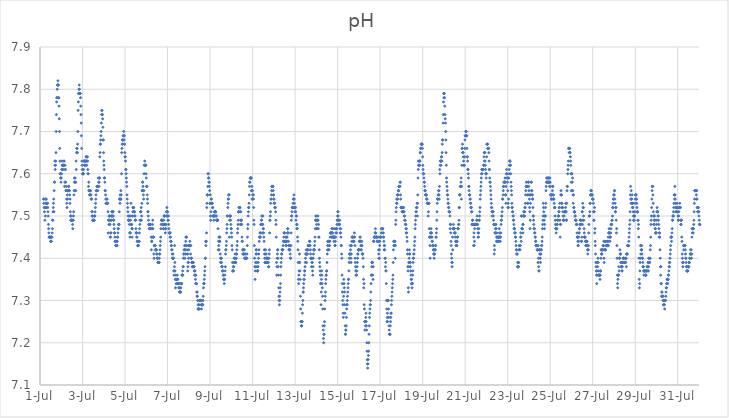
| Category | pH |
|---|---|
| 44743.166666666664 | 7.54 |
| 44743.177083333336 | 7.53 |
| 44743.1875 | 7.54 |
| 44743.197916666664 | 7.52 |
| 44743.208333333336 | 7.51 |
| 44743.21875 | 7.52 |
| 44743.229166666664 | 7.49 |
| 44743.239583333336 | 7.52 |
| 44743.25 | 7.5 |
| 44743.260416666664 | 7.53 |
| 44743.270833333336 | 7.54 |
| 44743.28125 | 7.54 |
| 44743.291666666664 | 7.54 |
| 44743.302083333336 | 7.52 |
| 44743.3125 | 7.53 |
| 44743.322916666664 | 7.53 |
| 44743.333333333336 | 7.53 |
| 44743.34375 | 7.53 |
| 44743.354166666664 | 7.53 |
| 44743.364583333336 | 7.52 |
| 44743.375 | 7.51 |
| 44743.385416666664 | 7.5 |
| 44743.395833333336 | 7.48 |
| 44743.40625 | 7.47 |
| 44743.416666666664 | 7.46 |
| 44743.427083333336 | 7.45 |
| 44743.4375 | 7.45 |
| 44743.447916666664 | 7.45 |
| 44743.458333333336 | 7.45 |
| 44743.46875 | 7.45 |
| 44743.479166666664 | 7.45 |
| 44743.489583333336 | 7.45 |
| 44743.5 | 7.44 |
| 44743.510416666664 | 7.44 |
| 44743.520833333336 | 7.44 |
| 44743.53125 | 7.44 |
| 44743.541666666664 | 7.45 |
| 44743.552083333336 | 7.45 |
| 44743.5625 | 7.45 |
| 44743.572916666664 | 7.46 |
| 44743.583333333336 | 7.47 |
| 44743.59375 | 7.49 |
| 44743.604166666664 | 7.49 |
| 44743.614583333336 | 7.51 |
| 44743.625 | 7.52 |
| 44743.635416666664 | 7.53 |
| 44743.645833333336 | 7.54 |
| 44743.65625 | 7.51 |
| 44743.666666666664 | 7.56 |
| 44743.677083333336 | 7.58 |
| 44743.6875 | 7.58 |
| 44743.697916666664 | 7.63 |
| 44743.708333333336 | 7.62 |
| 44743.71875 | 7.61 |
| 44743.729166666664 | 7.62 |
| 44743.739583333336 | 7.63 |
| 44743.75 | 7.65 |
| 44743.760416666664 | 7.7 |
| 44743.770833333336 | 7.74 |
| 44743.78125 | 7.77 |
| 44743.791666666664 | 7.78 |
| 44743.802083333336 | 7.78 |
| 44743.8125 | 7.8 |
| 44743.822916666664 | 7.81 |
| 44743.833333333336 | 7.81 |
| 44743.84375 | 7.82 |
| 44743.854166666664 | 7.81 |
| 44743.864583333336 | 7.81 |
| 44743.875 | 7.78 |
| 44743.885416666664 | 7.78 |
| 44743.895833333336 | 7.76 |
| 44743.90625 | 7.73 |
| 44743.916666666664 | 7.7 |
| 44743.927083333336 | 7.66 |
| 44743.9375 | 7.63 |
| 44743.947916666664 | 7.6 |
| 44743.958333333336 | 7.6 |
| 44743.96875 | 7.59 |
| 44743.979166666664 | 7.59 |
| 44743.989583333336 | 7.58 |
| 44744.0 | 7.59 |
| 44744.010416666664 | 7.6 |
| 44744.020833333336 | 7.61 |
| 44744.03125 | 7.63 |
| 44744.041666666664 | 7.62 |
| 44744.052083333336 | 7.61 |
| 44744.0625 | 7.62 |
| 44744.072916666664 | 7.62 |
| 44744.083333333336 | 7.61 |
| 44744.09375 | 7.62 |
| 44744.104166666664 | 7.62 |
| 44744.114583333336 | 7.62 |
| 44744.125 | 7.63 |
| 44744.135416666664 | 7.63 |
| 44744.145833333336 | 7.62 |
| 44744.15625 | 7.57 |
| 44744.166666666664 | 7.58 |
| 44744.177083333336 | 7.62 |
| 44744.1875 | 7.61 |
| 44744.197916666664 | 7.61 |
| 44744.208333333336 | 7.58 |
| 44744.21875 | 7.56 |
| 44744.229166666664 | 7.56 |
| 44744.239583333336 | 7.57 |
| 44744.25 | 7.54 |
| 44744.260416666664 | 7.53 |
| 44744.270833333336 | 7.52 |
| 44744.28125 | 7.55 |
| 44744.291666666664 | 7.56 |
| 44744.302083333336 | 7.54 |
| 44744.3125 | 7.56 |
| 44744.322916666664 | 7.56 |
| 44744.333333333336 | 7.56 |
| 44744.34375 | 7.57 |
| 44744.354166666664 | 7.57 |
| 44744.364583333336 | 7.56 |
| 44744.375 | 7.56 |
| 44744.385416666664 | 7.56 |
| 44744.395833333336 | 7.55 |
| 44744.40625 | 7.53 |
| 44744.416666666664 | 7.54 |
| 44744.427083333336 | 7.51 |
| 44744.4375 | 7.5 |
| 44744.447916666664 | 7.49 |
| 44744.458333333336 | 7.5 |
| 44744.46875 | 7.49 |
| 44744.479166666664 | 7.49 |
| 44744.489583333336 | 7.49 |
| 44744.5 | 7.49 |
| 44744.510416666664 | 7.49 |
| 44744.520833333336 | 7.49 |
| 44744.53125 | 7.48 |
| 44744.541666666664 | 7.47 |
| 44744.552083333336 | 7.49 |
| 44744.5625 | 7.49 |
| 44744.572916666664 | 7.5 |
| 44744.583333333336 | 7.51 |
| 44744.59375 | 7.55 |
| 44744.604166666664 | 7.56 |
| 44744.614583333336 | 7.59 |
| 44744.625 | 7.58 |
| 44744.635416666664 | 7.58 |
| 44744.645833333336 | 7.58 |
| 44744.65625 | 7.59 |
| 44744.666666666664 | 7.56 |
| 44744.677083333336 | 7.56 |
| 44744.6875 | 7.58 |
| 44744.697916666664 | 7.63 |
| 44744.708333333336 | 7.61 |
| 44744.71875 | 7.65 |
| 44744.729166666664 | 7.66 |
| 44744.739583333336 | 7.66 |
| 44744.75 | 7.65 |
| 44744.760416666664 | 7.65 |
| 44744.770833333336 | 7.67 |
| 44744.78125 | 7.7 |
| 44744.791666666664 | 7.75 |
| 44744.802083333336 | 7.77 |
| 44744.8125 | 7.79 |
| 44744.822916666664 | 7.79 |
| 44744.833333333336 | 7.8 |
| 44744.84375 | 7.81 |
| 44744.854166666664 | 7.8 |
| 44744.864583333336 | 7.79 |
| 44744.875 | 7.79 |
| 44744.885416666664 | 7.79 |
| 44744.895833333336 | 7.79 |
| 44744.90625 | 7.78 |
| 44744.916666666664 | 7.76 |
| 44744.927083333336 | 7.74 |
| 44744.9375 | 7.72 |
| 44744.947916666664 | 7.69 |
| 44744.958333333336 | 7.66 |
| 44744.96875 | 7.63 |
| 44744.979166666664 | 7.62 |
| 44744.989583333336 | 7.61 |
| 44745.0 | 7.6 |
| 44745.010416666664 | 7.6 |
| 44745.020833333336 | 7.6 |
| 44745.03125 | 7.6 |
| 44745.041666666664 | 7.6 |
| 44745.052083333336 | 7.61 |
| 44745.0625 | 7.63 |
| 44745.072916666664 | 7.63 |
| 44745.083333333336 | 7.63 |
| 44745.09375 | 7.62 |
| 44745.104166666664 | 7.62 |
| 44745.114583333336 | 7.63 |
| 44745.125 | 7.63 |
| 44745.135416666664 | 7.63 |
| 44745.15625 | 7.62 |
| 44745.166666666664 | 7.64 |
| 44745.177083333336 | 7.64 |
| 44745.1875 | 7.63 |
| 44745.197916666664 | 7.62 |
| 44745.208333333336 | 7.63 |
| 44745.21875 | 7.64 |
| 44745.229166666664 | 7.64 |
| 44745.239583333336 | 7.63 |
| 44745.25 | 7.61 |
| 44745.260416666664 | 7.6 |
| 44745.270833333336 | 7.6 |
| 44745.28125 | 7.57 |
| 44745.291666666664 | 7.58 |
| 44745.302083333336 | 7.56 |
| 44745.3125 | 7.56 |
| 44745.322916666664 | 7.56 |
| 44745.333333333336 | 7.55 |
| 44745.34375 | 7.55 |
| 44745.354166666664 | 7.56 |
| 44745.364583333336 | 7.56 |
| 44745.375 | 7.56 |
| 44745.385416666664 | 7.55 |
| 44745.395833333336 | 7.55 |
| 44745.40625 | 7.54 |
| 44745.416666666664 | 7.54 |
| 44745.427083333336 | 7.54 |
| 44745.4375 | 7.51 |
| 44745.447916666664 | 7.5 |
| 44745.458333333336 | 7.51 |
| 44745.46875 | 7.5 |
| 44745.479166666664 | 7.49 |
| 44745.489583333336 | 7.49 |
| 44745.5 | 7.49 |
| 44745.510416666664 | 7.49 |
| 44745.520833333336 | 7.49 |
| 44745.53125 | 7.49 |
| 44745.541666666664 | 7.49 |
| 44745.552083333336 | 7.49 |
| 44745.5625 | 7.5 |
| 44745.572916666664 | 7.5 |
| 44745.583333333336 | 7.5 |
| 44745.59375 | 7.51 |
| 44745.604166666664 | 7.52 |
| 44745.614583333336 | 7.53 |
| 44745.625 | 7.54 |
| 44745.635416666664 | 7.55 |
| 44745.645833333336 | 7.56 |
| 44745.65625 | 7.56 |
| 44745.666666666664 | 7.56 |
| 44745.677083333336 | 7.57 |
| 44745.6875 | 7.57 |
| 44745.697916666664 | 7.57 |
| 44745.708333333336 | 7.57 |
| 44745.71875 | 7.56 |
| 44745.729166666664 | 7.57 |
| 44745.739583333336 | 7.59 |
| 44745.75 | 7.57 |
| 44745.760416666664 | 7.58 |
| 44745.770833333336 | 7.57 |
| 44745.78125 | 7.58 |
| 44745.791666666664 | 7.59 |
| 44745.802083333336 | 7.59 |
| 44745.8125 | 7.64 |
| 44745.822916666664 | 7.65 |
| 44745.833333333336 | 7.67 |
| 44745.84375 | 7.67 |
| 44745.854166666664 | 7.68 |
| 44745.864583333336 | 7.69 |
| 44745.875 | 7.7 |
| 44745.885416666664 | 7.72 |
| 44745.895833333336 | 7.74 |
| 44745.90625 | 7.75 |
| 44745.916666666664 | 7.75 |
| 44745.927083333336 | 7.74 |
| 44745.9375 | 7.74 |
| 44745.947916666664 | 7.73 |
| 44745.958333333336 | 7.71 |
| 44745.96875 | 7.68 |
| 44745.979166666664 | 7.68 |
| 44745.989583333336 | 7.65 |
| 44746.0 | 7.63 |
| 44746.010416666664 | 7.62 |
| 44746.020833333336 | 7.61 |
| 44746.03125 | 7.59 |
| 44746.041666666664 | 7.59 |
| 44746.052083333336 | 7.58 |
| 44746.0625 | 7.56 |
| 44746.072916666664 | 7.56 |
| 44746.083333333336 | 7.55 |
| 44746.09375 | 7.54 |
| 44746.104166666664 | 7.53 |
| 44746.114583333336 | 7.53 |
| 44746.125 | 7.53 |
| 44746.135416666664 | 7.53 |
| 44746.145833333336 | 7.54 |
| 44746.15625 | 7.54 |
| 44746.166666666664 | 7.53 |
| 44746.177083333336 | 7.53 |
| 44746.1875 | 7.53 |
| 44746.197916666664 | 7.51 |
| 44746.208333333336 | 7.46 |
| 44746.21875 | 7.49 |
| 44746.229166666664 | 7.49 |
| 44746.239583333336 | 7.48 |
| 44746.25 | 7.5 |
| 44746.260416666664 | 7.49 |
| 44746.270833333336 | 7.5 |
| 44746.28125 | 7.5 |
| 44746.291666666664 | 7.48 |
| 44746.302083333336 | 7.45 |
| 44746.3125 | 7.45 |
| 44746.322916666664 | 7.46 |
| 44746.333333333336 | 7.49 |
| 44746.34375 | 7.46 |
| 44746.354166666664 | 7.49 |
| 44746.364583333336 | 7.5 |
| 44746.375 | 7.51 |
| 44746.385416666664 | 7.5 |
| 44746.395833333336 | 7.51 |
| 44746.40625 | 7.5 |
| 44746.416666666664 | 7.51 |
| 44746.427083333336 | 7.51 |
| 44746.4375 | 7.51 |
| 44746.447916666664 | 7.5 |
| 44746.458333333336 | 7.49 |
| 44746.46875 | 7.49 |
| 44746.479166666664 | 7.48 |
| 44746.489583333336 | 7.47 |
| 44746.5 | 7.46 |
| 44746.510416666664 | 7.46 |
| 44746.520833333336 | 7.45 |
| 44746.53125 | 7.44 |
| 44746.541666666664 | 7.44 |
| 44746.552083333336 | 7.44 |
| 44746.5625 | 7.43 |
| 44746.572916666664 | 7.43 |
| 44746.583333333336 | 7.44 |
| 44746.59375 | 7.43 |
| 44746.604166666664 | 7.43 |
| 44746.614583333336 | 7.44 |
| 44746.625 | 7.43 |
| 44746.635416666664 | 7.44 |
| 44746.645833333336 | 7.45 |
| 44746.65625 | 7.45 |
| 44746.666666666664 | 7.46 |
| 44746.677083333336 | 7.47 |
| 44746.6875 | 7.47 |
| 44746.697916666664 | 7.48 |
| 44746.708333333336 | 7.48 |
| 44746.71875 | 7.48 |
| 44746.729166666664 | 7.51 |
| 44746.739583333336 | 7.54 |
| 44746.75 | 7.54 |
| 44746.760416666664 | 7.53 |
| 44746.770833333336 | 7.55 |
| 44746.78125 | 7.54 |
| 44746.791666666664 | 7.54 |
| 44746.802083333336 | 7.56 |
| 44746.8125 | 7.54 |
| 44746.822916666664 | 7.55 |
| 44746.833333333336 | 7.6 |
| 44746.84375 | 7.65 |
| 44746.854166666664 | 7.66 |
| 44746.864583333336 | 7.67 |
| 44746.875 | 7.68 |
| 44746.885416666664 | 7.68 |
| 44746.895833333336 | 7.67 |
| 44746.90625 | 7.69 |
| 44746.916666666664 | 7.68 |
| 44746.927083333336 | 7.69 |
| 44746.9375 | 7.7 |
| 44746.947916666664 | 7.69 |
| 44746.958333333336 | 7.68 |
| 44746.96875 | 7.69 |
| 44746.979166666664 | 7.67 |
| 44746.989583333336 | 7.65 |
| 44747.0 | 7.64 |
| 44747.010416666664 | 7.64 |
| 44747.020833333336 | 7.63 |
| 44747.03125 | 7.61 |
| 44747.041666666664 | 7.61 |
| 44747.052083333336 | 7.6 |
| 44747.0625 | 7.59 |
| 44747.072916666664 | 7.58 |
| 44747.083333333336 | 7.57 |
| 44747.09375 | 7.55 |
| 44747.104166666664 | 7.54 |
| 44747.114583333336 | 7.53 |
| 44747.125 | 7.52 |
| 44747.135416666664 | 7.51 |
| 44747.145833333336 | 7.5 |
| 44747.15625 | 7.49 |
| 44747.166666666664 | 7.49 |
| 44747.177083333336 | 7.49 |
| 44747.1875 | 7.49 |
| 44747.197916666664 | 7.5 |
| 44747.208333333336 | 7.48 |
| 44747.21875 | 7.46 |
| 44747.229166666664 | 7.45 |
| 44747.239583333336 | 7.46 |
| 44747.25 | 7.46 |
| 44747.260416666664 | 7.49 |
| 44747.270833333336 | 7.5 |
| 44747.28125 | 7.53 |
| 44747.291666666664 | 7.48 |
| 44747.302083333336 | 7.48 |
| 44747.3125 | 7.48 |
| 44747.322916666664 | 7.47 |
| 44747.333333333336 | 7.45 |
| 44747.34375 | 7.47 |
| 44747.354166666664 | 7.5 |
| 44747.364583333336 | 7.51 |
| 44747.375 | 7.52 |
| 44747.385416666664 | 7.52 |
| 44747.395833333336 | 7.52 |
| 44747.40625 | 7.52 |
| 44747.416666666664 | 7.51 |
| 44747.427083333336 | 7.51 |
| 44747.4375 | 7.51 |
| 44747.447916666664 | 7.51 |
| 44747.458333333336 | 7.5 |
| 44747.46875 | 7.5 |
| 44747.479166666664 | 7.49 |
| 44747.489583333336 | 7.49 |
| 44747.5 | 7.49 |
| 44747.510416666664 | 7.47 |
| 44747.520833333336 | 7.46 |
| 44747.53125 | 7.46 |
| 44747.541666666664 | 7.46 |
| 44747.552083333336 | 7.45 |
| 44747.5625 | 7.45 |
| 44747.572916666664 | 7.44 |
| 44747.583333333336 | 7.44 |
| 44747.59375 | 7.43 |
| 44747.604166666664 | 7.43 |
| 44747.614583333336 | 7.43 |
| 44747.625 | 7.43 |
| 44747.635416666664 | 7.43 |
| 44747.645833333336 | 7.44 |
| 44747.65625 | 7.44 |
| 44747.666666666664 | 7.44 |
| 44747.677083333336 | 7.46 |
| 44747.6875 | 7.47 |
| 44747.697916666664 | 7.48 |
| 44747.708333333336 | 7.49 |
| 44747.71875 | 7.49 |
| 44747.729166666664 | 7.51 |
| 44747.739583333336 | 7.51 |
| 44747.75 | 7.51 |
| 44747.760416666664 | 7.52 |
| 44747.770833333336 | 7.49 |
| 44747.78125 | 7.5 |
| 44747.791666666664 | 7.53 |
| 44747.802083333336 | 7.56 |
| 44747.8125 | 7.56 |
| 44747.822916666664 | 7.58 |
| 44747.833333333336 | 7.58 |
| 44747.84375 | 7.57 |
| 44747.854166666664 | 7.56 |
| 44747.864583333336 | 7.55 |
| 44747.875 | 7.54 |
| 44747.885416666664 | 7.56 |
| 44747.895833333336 | 7.6 |
| 44747.90625 | 7.62 |
| 44747.916666666664 | 7.62 |
| 44747.927083333336 | 7.63 |
| 44747.9375 | 7.62 |
| 44747.947916666664 | 7.62 |
| 44747.958333333336 | 7.62 |
| 44747.96875 | 7.62 |
| 44747.979166666664 | 7.62 |
| 44747.989583333336 | 7.6 |
| 44748.0 | 7.59 |
| 44748.010416666664 | 7.57 |
| 44748.020833333336 | 7.57 |
| 44748.03125 | 7.57 |
| 44748.041666666664 | 7.55 |
| 44748.052083333336 | 7.54 |
| 44748.0625 | 7.53 |
| 44748.072916666664 | 7.51 |
| 44748.083333333336 | 7.51 |
| 44748.09375 | 7.5 |
| 44748.104166666664 | 7.49 |
| 44748.114583333336 | 7.48 |
| 44748.125 | 7.48 |
| 44748.135416666664 | 7.47 |
| 44748.145833333336 | 7.48 |
| 44748.15625 | 7.48 |
| 44748.166666666664 | 7.47 |
| 44748.177083333336 | 7.48 |
| 44748.1875 | 7.48 |
| 44748.197916666664 | 7.48 |
| 44748.208333333336 | 7.47 |
| 44748.21875 | 7.47 |
| 44748.229166666664 | 7.45 |
| 44748.239583333336 | 7.42 |
| 44748.25 | 7.44 |
| 44748.260416666664 | 7.44 |
| 44748.270833333336 | 7.45 |
| 44748.28125 | 7.47 |
| 44748.291666666664 | 7.48 |
| 44748.302083333336 | 7.49 |
| 44748.3125 | 7.47 |
| 44748.322916666664 | 7.45 |
| 44748.333333333336 | 7.45 |
| 44748.34375 | 7.45 |
| 44748.354166666664 | 7.41 |
| 44748.364583333336 | 7.4 |
| 44748.375 | 7.43 |
| 44748.385416666664 | 7.43 |
| 44748.395833333336 | 7.43 |
| 44748.40625 | 7.43 |
| 44748.416666666664 | 7.43 |
| 44748.427083333336 | 7.42 |
| 44748.4375 | 7.42 |
| 44748.447916666664 | 7.42 |
| 44748.458333333336 | 7.42 |
| 44748.46875 | 7.42 |
| 44748.479166666664 | 7.42 |
| 44748.489583333336 | 7.41 |
| 44748.5 | 7.41 |
| 44748.510416666664 | 7.4 |
| 44748.520833333336 | 7.4 |
| 44748.53125 | 7.4 |
| 44748.541666666664 | 7.4 |
| 44748.552083333336 | 7.39 |
| 44748.5625 | 7.39 |
| 44748.572916666664 | 7.39 |
| 44748.583333333336 | 7.39 |
| 44748.59375 | 7.39 |
| 44748.604166666664 | 7.39 |
| 44748.614583333336 | 7.4 |
| 44748.625 | 7.41 |
| 44748.635416666664 | 7.41 |
| 44748.645833333336 | 7.42 |
| 44748.65625 | 7.43 |
| 44748.666666666664 | 7.44 |
| 44748.677083333336 | 7.45 |
| 44748.6875 | 7.47 |
| 44748.697916666664 | 7.48 |
| 44748.708333333336 | 7.49 |
| 44748.71875 | 7.49 |
| 44748.729166666664 | 7.49 |
| 44748.739583333336 | 7.49 |
| 44748.75 | 7.49 |
| 44748.760416666664 | 7.49 |
| 44748.770833333336 | 7.48 |
| 44748.78125 | 7.48 |
| 44748.791666666664 | 7.48 |
| 44748.802083333336 | 7.47 |
| 44748.8125 | 7.47 |
| 44748.822916666664 | 7.49 |
| 44748.833333333336 | 7.5 |
| 44748.84375 | 7.5 |
| 44748.854166666664 | 7.5 |
| 44748.864583333336 | 7.48 |
| 44748.875 | 7.48 |
| 44748.885416666664 | 7.48 |
| 44748.895833333336 | 7.46 |
| 44748.90625 | 7.47 |
| 44748.916666666664 | 7.47 |
| 44748.927083333336 | 7.48 |
| 44748.9375 | 7.5 |
| 44748.947916666664 | 7.51 |
| 44748.958333333336 | 7.5 |
| 44748.96875 | 7.52 |
| 44748.979166666664 | 7.51 |
| 44748.989583333336 | 7.51 |
| 44749.0 | 7.51 |
| 44749.010416666664 | 7.5 |
| 44749.020833333336 | 7.49 |
| 44749.03125 | 7.49 |
| 44749.041666666664 | 7.5 |
| 44749.052083333336 | 7.48 |
| 44749.0625 | 7.47 |
| 44749.072916666664 | 7.46 |
| 44749.083333333336 | 7.46 |
| 44749.09375 | 7.46 |
| 44749.104166666664 | 7.46 |
| 44749.114583333336 | 7.45 |
| 44749.125 | 7.46 |
| 44749.135416666664 | 7.45 |
| 44749.145833333336 | 7.44 |
| 44749.15625 | 7.44 |
| 44749.166666666664 | 7.44 |
| 44749.177083333336 | 7.43 |
| 44749.1875 | 7.43 |
| 44749.197916666664 | 7.42 |
| 44749.208333333336 | 7.42 |
| 44749.21875 | 7.41 |
| 44749.229166666664 | 7.4 |
| 44749.239583333336 | 7.4 |
| 44749.25 | 7.4 |
| 44749.260416666664 | 7.41 |
| 44749.270833333336 | 7.4 |
| 44749.28125 | 7.4 |
| 44749.291666666664 | 7.37 |
| 44749.302083333336 | 7.36 |
| 44749.3125 | 7.37 |
| 44749.322916666664 | 7.38 |
| 44749.333333333336 | 7.43 |
| 44749.34375 | 7.39 |
| 44749.354166666664 | 7.37 |
| 44749.364583333336 | 7.35 |
| 44749.375 | 7.33 |
| 44749.385416666664 | 7.36 |
| 44749.395833333336 | 7.35 |
| 44749.40625 | 7.34 |
| 44749.416666666664 | 7.35 |
| 44749.427083333336 | 7.34 |
| 44749.4375 | 7.35 |
| 44749.447916666664 | 7.35 |
| 44749.458333333336 | 7.36 |
| 44749.46875 | 7.35 |
| 44749.479166666664 | 7.35 |
| 44749.489583333336 | 7.34 |
| 44749.5 | 7.34 |
| 44749.510416666664 | 7.34 |
| 44749.520833333336 | 7.34 |
| 44749.53125 | 7.33 |
| 44749.541666666664 | 7.33 |
| 44749.552083333336 | 7.34 |
| 44749.5625 | 7.32 |
| 44749.572916666664 | 7.32 |
| 44749.583333333336 | 7.33 |
| 44749.59375 | 7.32 |
| 44749.604166666664 | 7.32 |
| 44749.614583333336 | 7.32 |
| 44749.625 | 7.33 |
| 44749.635416666664 | 7.34 |
| 44749.645833333336 | 7.34 |
| 44749.65625 | 7.34 |
| 44749.666666666664 | 7.34 |
| 44749.677083333336 | 7.36 |
| 44749.6875 | 7.36 |
| 44749.697916666664 | 7.36 |
| 44749.708333333336 | 7.37 |
| 44749.71875 | 7.36 |
| 44749.729166666664 | 7.38 |
| 44749.739583333336 | 7.38 |
| 44749.75 | 7.4 |
| 44749.760416666664 | 7.41 |
| 44749.770833333336 | 7.41 |
| 44749.78125 | 7.42 |
| 44749.791666666664 | 7.42 |
| 44749.802083333336 | 7.43 |
| 44749.8125 | 7.4 |
| 44749.822916666664 | 7.43 |
| 44749.833333333336 | 7.42 |
| 44749.84375 | 7.41 |
| 44749.854166666664 | 7.44 |
| 44749.864583333336 | 7.45 |
| 44749.875 | 7.45 |
| 44749.885416666664 | 7.43 |
| 44749.895833333336 | 7.45 |
| 44749.90625 | 7.43 |
| 44749.916666666664 | 7.42 |
| 44749.927083333336 | 7.41 |
| 44749.9375 | 7.41 |
| 44749.947916666664 | 7.37 |
| 44749.958333333336 | 7.38 |
| 44749.96875 | 7.39 |
| 44749.979166666664 | 7.39 |
| 44749.989583333336 | 7.4 |
| 44750.0 | 7.42 |
| 44750.010416666664 | 7.43 |
| 44750.020833333336 | 7.43 |
| 44750.03125 | 7.43 |
| 44750.041666666664 | 7.43 |
| 44750.052083333336 | 7.44 |
| 44750.0625 | 7.43 |
| 44750.072916666664 | 7.43 |
| 44750.083333333336 | 7.41 |
| 44750.09375 | 7.43 |
| 44750.104166666664 | 7.4 |
| 44750.114583333336 | 7.4 |
| 44750.125 | 7.4 |
| 44750.135416666664 | 7.39 |
| 44750.145833333336 | 7.39 |
| 44750.15625 | 7.39 |
| 44750.166666666664 | 7.38 |
| 44750.177083333336 | 7.38 |
| 44750.1875 | 7.39 |
| 44750.197916666664 | 7.39 |
| 44750.208333333336 | 7.39 |
| 44750.21875 | 7.38 |
| 44750.229166666664 | 7.38 |
| 44750.239583333336 | 7.38 |
| 44750.25 | 7.38 |
| 44750.260416666664 | 7.37 |
| 44750.270833333336 | 7.36 |
| 44750.28125 | 7.37 |
| 44750.291666666664 | 7.37 |
| 44750.302083333336 | 7.36 |
| 44750.3125 | 7.35 |
| 44750.322916666664 | 7.34 |
| 44750.333333333336 | 7.36 |
| 44750.34375 | 7.34 |
| 44750.354166666664 | 7.34 |
| 44750.364583333336 | 7.34 |
| 44750.375 | 7.32 |
| 44750.385416666664 | 7.31 |
| 44750.395833333336 | 7.32 |
| 44750.40625 | 7.31 |
| 44750.416666666664 | 7.3 |
| 44750.427083333336 | 7.28 |
| 44750.4375 | 7.29 |
| 44750.447916666664 | 7.28 |
| 44750.458333333336 | 7.28 |
| 44750.46875 | 7.28 |
| 44750.479166666664 | 7.29 |
| 44750.489583333336 | 7.28 |
| 44750.5 | 7.3 |
| 44750.510416666664 | 7.3 |
| 44750.520833333336 | 7.3 |
| 44750.53125 | 7.3 |
| 44750.541666666664 | 7.3 |
| 44750.552083333336 | 7.3 |
| 44750.5625 | 7.3 |
| 44750.572916666664 | 7.3 |
| 44750.583333333336 | 7.29 |
| 44750.59375 | 7.28 |
| 44750.604166666664 | 7.29 |
| 44750.614583333336 | 7.29 |
| 44750.625 | 7.29 |
| 44750.635416666664 | 7.29 |
| 44750.645833333336 | 7.29 |
| 44750.65625 | 7.29 |
| 44750.666666666664 | 7.3 |
| 44750.677083333336 | 7.31 |
| 44750.6875 | 7.33 |
| 44750.697916666664 | 7.34 |
| 44750.708333333336 | 7.34 |
| 44750.71875 | 7.34 |
| 44750.729166666664 | 7.35 |
| 44750.739583333336 | 7.36 |
| 44750.75 | 7.37 |
| 44750.760416666664 | 7.38 |
| 44750.770833333336 | 7.4 |
| 44750.78125 | 7.4 |
| 44750.791666666664 | 7.44 |
| 44750.802083333336 | 7.43 |
| 44750.8125 | 7.44 |
| 44750.822916666664 | 7.44 |
| 44750.833333333336 | 7.46 |
| 44750.84375 | 7.52 |
| 44750.854166666664 | 7.53 |
| 44750.864583333336 | 7.55 |
| 44750.875 | 7.55 |
| 44750.885416666664 | 7.55 |
| 44750.895833333336 | 7.57 |
| 44750.90625 | 7.6 |
| 44750.916666666664 | 7.6 |
| 44750.927083333336 | 7.59 |
| 44750.9375 | 7.59 |
| 44750.947916666664 | 7.58 |
| 44750.958333333336 | 7.58 |
| 44750.96875 | 7.57 |
| 44750.979166666664 | 7.56 |
| 44750.989583333336 | 7.53 |
| 44751.0 | 7.53 |
| 44751.010416666664 | 7.55 |
| 44751.020833333336 | 7.5 |
| 44751.03125 | 7.49 |
| 44751.041666666664 | 7.51 |
| 44751.052083333336 | 7.54 |
| 44751.0625 | 7.54 |
| 44751.072916666664 | 7.53 |
| 44751.083333333336 | 7.53 |
| 44751.09375 | 7.53 |
| 44751.104166666664 | 7.53 |
| 44751.114583333336 | 7.52 |
| 44751.125 | 7.52 |
| 44751.135416666664 | 7.5 |
| 44751.145833333336 | 7.5 |
| 44751.15625 | 7.5 |
| 44751.166666666664 | 7.5 |
| 44751.177083333336 | 7.49 |
| 44751.1875 | 7.5 |
| 44751.197916666664 | 7.5 |
| 44751.208333333336 | 7.51 |
| 44751.21875 | 7.51 |
| 44751.229166666664 | 7.51 |
| 44751.239583333336 | 7.51 |
| 44751.25 | 7.51 |
| 44751.260416666664 | 7.5 |
| 44751.270833333336 | 7.51 |
| 44751.28125 | 7.5 |
| 44751.291666666664 | 7.5 |
| 44751.302083333336 | 7.49 |
| 44751.3125 | 7.49 |
| 44751.322916666664 | 7.49 |
| 44751.333333333336 | 7.49 |
| 44751.34375 | 7.49 |
| 44751.354166666664 | 7.49 |
| 44751.364583333336 | 7.49 |
| 44751.375 | 7.47 |
| 44751.385416666664 | 7.42 |
| 44751.395833333336 | 7.44 |
| 44751.40625 | 7.43 |
| 44751.416666666664 | 7.45 |
| 44751.427083333336 | 7.42 |
| 44751.4375 | 7.45 |
| 44751.447916666664 | 7.44 |
| 44751.458333333336 | 7.44 |
| 44751.46875 | 7.45 |
| 44751.479166666664 | 7.41 |
| 44751.489583333336 | 7.39 |
| 44751.5 | 7.4 |
| 44751.510416666664 | 7.4 |
| 44751.520833333336 | 7.4 |
| 44751.53125 | 7.4 |
| 44751.541666666664 | 7.39 |
| 44751.552083333336 | 7.38 |
| 44751.5625 | 7.38 |
| 44751.572916666664 | 7.38 |
| 44751.583333333336 | 7.37 |
| 44751.59375 | 7.37 |
| 44751.604166666664 | 7.37 |
| 44751.614583333336 | 7.36 |
| 44751.625 | 7.36 |
| 44751.635416666664 | 7.35 |
| 44751.645833333336 | 7.35 |
| 44751.65625 | 7.35 |
| 44751.666666666664 | 7.34 |
| 44751.677083333336 | 7.35 |
| 44751.6875 | 7.35 |
| 44751.697916666664 | 7.36 |
| 44751.708333333336 | 7.37 |
| 44751.71875 | 7.38 |
| 44751.729166666664 | 7.41 |
| 44751.739583333336 | 7.42 |
| 44751.75 | 7.42 |
| 44751.760416666664 | 7.43 |
| 44751.770833333336 | 7.44 |
| 44751.78125 | 7.46 |
| 44751.791666666664 | 7.47 |
| 44751.802083333336 | 7.48 |
| 44751.8125 | 7.5 |
| 44751.822916666664 | 7.5 |
| 44751.833333333336 | 7.52 |
| 44751.84375 | 7.53 |
| 44751.854166666664 | 7.54 |
| 44751.864583333336 | 7.54 |
| 44751.875 | 7.55 |
| 44751.885416666664 | 7.55 |
| 44751.895833333336 | 7.55 |
| 44751.90625 | 7.45 |
| 44751.916666666664 | 7.49 |
| 44751.927083333336 | 7.5 |
| 44751.9375 | 7.5 |
| 44751.947916666664 | 7.5 |
| 44751.958333333336 | 7.5 |
| 44751.96875 | 7.49 |
| 44751.979166666664 | 7.48 |
| 44751.989583333336 | 7.47 |
| 44752.0 | 7.47 |
| 44752.010416666664 | 7.46 |
| 44752.020833333336 | 7.45 |
| 44752.03125 | 7.43 |
| 44752.041666666664 | 7.42 |
| 44752.052083333336 | 7.39 |
| 44752.0625 | 7.37 |
| 44752.072916666664 | 7.37 |
| 44752.083333333336 | 7.37 |
| 44752.09375 | 7.38 |
| 44752.104166666664 | 7.37 |
| 44752.114583333336 | 7.38 |
| 44752.125 | 7.39 |
| 44752.135416666664 | 7.4 |
| 44752.145833333336 | 7.4 |
| 44752.15625 | 7.39 |
| 44752.166666666664 | 7.4 |
| 44752.177083333336 | 7.41 |
| 44752.1875 | 7.39 |
| 44752.197916666664 | 7.39 |
| 44752.208333333336 | 7.39 |
| 44752.21875 | 7.4 |
| 44752.229166666664 | 7.4 |
| 44752.239583333336 | 7.41 |
| 44752.25 | 7.41 |
| 44752.260416666664 | 7.42 |
| 44752.270833333336 | 7.43 |
| 44752.28125 | 7.44 |
| 44752.291666666664 | 7.46 |
| 44752.302083333336 | 7.47 |
| 44752.3125 | 7.48 |
| 44752.322916666664 | 7.49 |
| 44752.333333333336 | 7.51 |
| 44752.34375 | 7.51 |
| 44752.354166666664 | 7.51 |
| 44752.364583333336 | 7.52 |
| 44752.375 | 7.52 |
| 44752.385416666664 | 7.52 |
| 44752.395833333336 | 7.52 |
| 44752.40625 | 7.52 |
| 44752.416666666664 | 7.51 |
| 44752.427083333336 | 7.48 |
| 44752.4375 | 7.49 |
| 44752.447916666664 | 7.51 |
| 44752.458333333336 | 7.49 |
| 44752.46875 | 7.48 |
| 44752.479166666664 | 7.49 |
| 44752.489583333336 | 7.48 |
| 44752.5 | 7.45 |
| 44752.510416666664 | 7.44 |
| 44752.520833333336 | 7.44 |
| 44752.53125 | 7.42 |
| 44752.541666666664 | 7.41 |
| 44752.552083333336 | 7.42 |
| 44752.5625 | 7.41 |
| 44752.572916666664 | 7.41 |
| 44752.583333333336 | 7.42 |
| 44752.59375 | 7.42 |
| 44752.604166666664 | 7.42 |
| 44752.614583333336 | 7.41 |
| 44752.625 | 7.4 |
| 44752.635416666664 | 7.4 |
| 44752.645833333336 | 7.4 |
| 44752.65625 | 7.4 |
| 44752.666666666664 | 7.4 |
| 44752.677083333336 | 7.41 |
| 44752.6875 | 7.4 |
| 44752.697916666664 | 7.4 |
| 44752.708333333336 | 7.4 |
| 44752.71875 | 7.4 |
| 44752.729166666664 | 7.4 |
| 44752.739583333336 | 7.41 |
| 44752.75 | 7.43 |
| 44752.760416666664 | 7.45 |
| 44752.770833333336 | 7.47 |
| 44752.78125 | 7.48 |
| 44752.791666666664 | 7.5 |
| 44752.802083333336 | 7.51 |
| 44752.8125 | 7.52 |
| 44752.822916666664 | 7.52 |
| 44752.833333333336 | 7.53 |
| 44752.84375 | 7.55 |
| 44752.854166666664 | 7.57 |
| 44752.864583333336 | 7.58 |
| 44752.875 | 7.58 |
| 44752.885416666664 | 7.59 |
| 44752.895833333336 | 7.59 |
| 44752.90625 | 7.59 |
| 44752.916666666664 | 7.59 |
| 44752.927083333336 | 7.59 |
| 44752.9375 | 7.59 |
| 44752.947916666664 | 7.56 |
| 44752.958333333336 | 7.56 |
| 44752.96875 | 7.57 |
| 44752.979166666664 | 7.54 |
| 44752.989583333336 | 7.54 |
| 44753.0 | 7.56 |
| 44753.010416666664 | 7.55 |
| 44753.020833333336 | 7.55 |
| 44753.03125 | 7.55 |
| 44753.041666666664 | 7.54 |
| 44753.052083333336 | 7.52 |
| 44753.0625 | 7.49 |
| 44753.072916666664 | 7.48 |
| 44753.083333333336 | 7.43 |
| 44753.09375 | 7.4 |
| 44753.104166666664 | 7.38 |
| 44753.114583333336 | 7.35 |
| 44753.125 | 7.37 |
| 44753.135416666664 | 7.39 |
| 44753.145833333336 | 7.38 |
| 44753.15625 | 7.41 |
| 44753.166666666664 | 7.42 |
| 44753.177083333336 | 7.42 |
| 44753.1875 | 7.41 |
| 44753.197916666664 | 7.39 |
| 44753.208333333336 | 7.38 |
| 44753.21875 | 7.37 |
| 44753.229166666664 | 7.37 |
| 44753.239583333336 | 7.37 |
| 44753.25 | 7.37 |
| 44753.260416666664 | 7.38 |
| 44753.270833333336 | 7.39 |
| 44753.28125 | 7.4 |
| 44753.291666666664 | 7.41 |
| 44753.302083333336 | 7.42 |
| 44753.3125 | 7.44 |
| 44753.322916666664 | 7.45 |
| 44753.333333333336 | 7.45 |
| 44753.34375 | 7.46 |
| 44753.354166666664 | 7.45 |
| 44753.364583333336 | 7.45 |
| 44753.375 | 7.46 |
| 44753.385416666664 | 7.48 |
| 44753.395833333336 | 7.48 |
| 44753.40625 | 7.48 |
| 44753.416666666664 | 7.49 |
| 44753.427083333336 | 7.49 |
| 44753.4375 | 7.5 |
| 44753.447916666664 | 7.5 |
| 44753.458333333336 | 7.48 |
| 44753.46875 | 7.46 |
| 44753.479166666664 | 7.48 |
| 44753.489583333336 | 7.5 |
| 44753.5 | 7.47 |
| 44753.510416666664 | 7.47 |
| 44753.520833333336 | 7.46 |
| 44753.53125 | 7.45 |
| 44753.541666666664 | 7.44 |
| 44753.552083333336 | 7.42 |
| 44753.5625 | 7.41 |
| 44753.572916666664 | 7.4 |
| 44753.583333333336 | 7.39 |
| 44753.59375 | 7.39 |
| 44753.604166666664 | 7.39 |
| 44753.614583333336 | 7.42 |
| 44753.625 | 7.41 |
| 44753.635416666664 | 7.41 |
| 44753.645833333336 | 7.4 |
| 44753.65625 | 7.4 |
| 44753.666666666664 | 7.4 |
| 44753.677083333336 | 7.39 |
| 44753.6875 | 7.39 |
| 44753.697916666664 | 7.39 |
| 44753.708333333336 | 7.4 |
| 44753.71875 | 7.4 |
| 44753.729166666664 | 7.4 |
| 44753.739583333336 | 7.39 |
| 44753.75 | 7.38 |
| 44753.760416666664 | 7.38 |
| 44753.770833333336 | 7.4 |
| 44753.78125 | 7.41 |
| 44753.791666666664 | 7.42 |
| 44753.802083333336 | 7.46 |
| 44753.8125 | 7.49 |
| 44753.822916666664 | 7.49 |
| 44753.833333333336 | 7.5 |
| 44753.84375 | 7.51 |
| 44753.854166666664 | 7.53 |
| 44753.864583333336 | 7.54 |
| 44753.875 | 7.54 |
| 44753.885416666664 | 7.55 |
| 44753.895833333336 | 7.56 |
| 44753.90625 | 7.57 |
| 44753.916666666664 | 7.57 |
| 44753.927083333336 | 7.57 |
| 44753.9375 | 7.57 |
| 44753.947916666664 | 7.57 |
| 44753.958333333336 | 7.57 |
| 44753.96875 | 7.56 |
| 44753.979166666664 | 7.55 |
| 44753.989583333336 | 7.55 |
| 44754.0 | 7.54 |
| 44754.010416666664 | 7.54 |
| 44754.020833333336 | 7.53 |
| 44754.03125 | 7.53 |
| 44754.041666666664 | 7.53 |
| 44754.052083333336 | 7.52 |
| 44754.0625 | 7.52 |
| 44754.072916666664 | 7.52 |
| 44754.083333333336 | 7.51 |
| 44754.09375 | 7.49 |
| 44754.104166666664 | 7.48 |
| 44754.114583333336 | 7.45 |
| 44754.125 | 7.39 |
| 44754.135416666664 | 7.36 |
| 44754.145833333336 | 7.38 |
| 44754.15625 | 7.4 |
| 44754.166666666664 | 7.41 |
| 44754.177083333336 | 7.42 |
| 44754.1875 | 7.42 |
| 44754.197916666664 | 7.4 |
| 44754.208333333336 | 7.38 |
| 44754.21875 | 7.36 |
| 44754.229166666664 | 7.33 |
| 44754.239583333336 | 7.31 |
| 44754.25 | 7.3 |
| 44754.260416666664 | 7.29 |
| 44754.270833333336 | 7.31 |
| 44754.28125 | 7.3 |
| 44754.291666666664 | 7.32 |
| 44754.302083333336 | 7.33 |
| 44754.3125 | 7.34 |
| 44754.322916666664 | 7.36 |
| 44754.333333333336 | 7.38 |
| 44754.34375 | 7.39 |
| 44754.354166666664 | 7.4 |
| 44754.364583333336 | 7.41 |
| 44754.375 | 7.41 |
| 44754.385416666664 | 7.42 |
| 44754.395833333336 | 7.42 |
| 44754.40625 | 7.42 |
| 44754.416666666664 | 7.42 |
| 44754.427083333336 | 7.42 |
| 44754.4375 | 7.43 |
| 44754.447916666664 | 7.44 |
| 44754.458333333336 | 7.44 |
| 44754.46875 | 7.45 |
| 44754.479166666664 | 7.46 |
| 44754.489583333336 | 7.46 |
| 44754.5 | 7.46 |
| 44754.510416666664 | 7.44 |
| 44754.520833333336 | 7.44 |
| 44754.53125 | 7.44 |
| 44754.541666666664 | 7.44 |
| 44754.552083333336 | 7.44 |
| 44754.5625 | 7.45 |
| 44754.572916666664 | 7.43 |
| 44754.583333333336 | 7.43 |
| 44754.59375 | 7.44 |
| 44754.604166666664 | 7.45 |
| 44754.614583333336 | 7.44 |
| 44754.625 | 7.45 |
| 44754.635416666664 | 7.46 |
| 44754.645833333336 | 7.47 |
| 44754.65625 | 7.47 |
| 44754.666666666664 | 7.46 |
| 44754.677083333336 | 7.46 |
| 44754.6875 | 7.44 |
| 44754.697916666664 | 7.43 |
| 44754.708333333336 | 7.42 |
| 44754.71875 | 7.42 |
| 44754.729166666664 | 7.42 |
| 44754.739583333336 | 7.42 |
| 44754.75 | 7.43 |
| 44754.760416666664 | 7.42 |
| 44754.770833333336 | 7.41 |
| 44754.78125 | 7.4 |
| 44754.791666666664 | 7.4 |
| 44754.802083333336 | 7.43 |
| 44754.8125 | 7.46 |
| 44754.822916666664 | 7.49 |
| 44754.833333333336 | 7.5 |
| 44754.84375 | 7.5 |
| 44754.854166666664 | 7.51 |
| 44754.864583333336 | 7.52 |
| 44754.875 | 7.52 |
| 44754.885416666664 | 7.52 |
| 44754.895833333336 | 7.52 |
| 44754.90625 | 7.53 |
| 44754.916666666664 | 7.54 |
| 44754.927083333336 | 7.54 |
| 44754.9375 | 7.54 |
| 44754.947916666664 | 7.55 |
| 44754.958333333336 | 7.54 |
| 44754.96875 | 7.53 |
| 44754.979166666664 | 7.52 |
| 44754.989583333336 | 7.52 |
| 44755.0 | 7.51 |
| 44755.010416666664 | 7.52 |
| 44755.020833333336 | 7.52 |
| 44755.03125 | 7.51 |
| 44755.041666666664 | 7.49 |
| 44755.052083333336 | 7.5 |
| 44755.0625 | 7.5 |
| 44755.072916666664 | 7.48 |
| 44755.083333333336 | 7.47 |
| 44755.09375 | 7.48 |
| 44755.104166666664 | 7.47 |
| 44755.114583333336 | 7.45 |
| 44755.125 | 7.44 |
| 44755.135416666664 | 7.42 |
| 44755.145833333336 | 7.39 |
| 44755.15625 | 7.35 |
| 44755.166666666664 | 7.34 |
| 44755.177083333336 | 7.36 |
| 44755.1875 | 7.37 |
| 44755.197916666664 | 7.39 |
| 44755.208333333336 | 7.41 |
| 44755.21875 | 7.39 |
| 44755.229166666664 | 7.37 |
| 44755.239583333336 | 7.35 |
| 44755.25 | 7.31 |
| 44755.260416666664 | 7.28 |
| 44755.270833333336 | 7.25 |
| 44755.28125 | 7.25 |
| 44755.291666666664 | 7.24 |
| 44755.302083333336 | 7.24 |
| 44755.3125 | 7.24 |
| 44755.322916666664 | 7.25 |
| 44755.333333333336 | 7.25 |
| 44755.34375 | 7.27 |
| 44755.354166666664 | 7.29 |
| 44755.364583333336 | 7.3 |
| 44755.375 | 7.32 |
| 44755.385416666664 | 7.32 |
| 44755.395833333336 | 7.33 |
| 44755.40625 | 7.34 |
| 44755.416666666664 | 7.35 |
| 44755.427083333336 | 7.35 |
| 44755.4375 | 7.36 |
| 44755.447916666664 | 7.37 |
| 44755.458333333336 | 7.37 |
| 44755.46875 | 7.38 |
| 44755.479166666664 | 7.39 |
| 44755.489583333336 | 7.4 |
| 44755.5 | 7.41 |
| 44755.510416666664 | 7.41 |
| 44755.520833333336 | 7.42 |
| 44755.53125 | 7.41 |
| 44755.541666666664 | 7.39 |
| 44755.552083333336 | 7.41 |
| 44755.5625 | 7.41 |
| 44755.572916666664 | 7.41 |
| 44755.583333333336 | 7.42 |
| 44755.59375 | 7.42 |
| 44755.604166666664 | 7.42 |
| 44755.614583333336 | 7.43 |
| 44755.625 | 7.43 |
| 44755.635416666664 | 7.43 |
| 44755.645833333336 | 7.43 |
| 44755.65625 | 7.43 |
| 44755.666666666664 | 7.43 |
| 44755.677083333336 | 7.44 |
| 44755.6875 | 7.44 |
| 44755.697916666664 | 7.44 |
| 44755.708333333336 | 7.43 |
| 44755.71875 | 7.42 |
| 44755.729166666664 | 7.41 |
| 44755.739583333336 | 7.4 |
| 44755.75 | 7.4 |
| 44755.760416666664 | 7.4 |
| 44755.770833333336 | 7.38 |
| 44755.78125 | 7.4 |
| 44755.791666666664 | 7.39 |
| 44755.802083333336 | 7.4 |
| 44755.8125 | 7.39 |
| 44755.822916666664 | 7.37 |
| 44755.833333333336 | 7.36 |
| 44755.84375 | 7.38 |
| 44755.854166666664 | 7.4 |
| 44755.864583333336 | 7.41 |
| 44755.875 | 7.42 |
| 44755.885416666664 | 7.42 |
| 44755.895833333336 | 7.42 |
| 44755.90625 | 7.42 |
| 44755.916666666664 | 7.43 |
| 44755.927083333336 | 7.44 |
| 44755.9375 | 7.45 |
| 44755.947916666664 | 7.47 |
| 44755.958333333336 | 7.49 |
| 44755.96875 | 7.49 |
| 44755.979166666664 | 7.5 |
| 44755.989583333336 | 7.5 |
| 44756.0 | 7.49 |
| 44756.010416666664 | 7.48 |
| 44756.020833333336 | 7.47 |
| 44756.03125 | 7.47 |
| 44756.041666666664 | 7.49 |
| 44756.052083333336 | 7.49 |
| 44756.0625 | 7.49 |
| 44756.072916666664 | 7.5 |
| 44756.083333333336 | 7.49 |
| 44756.09375 | 7.47 |
| 44756.104166666664 | 7.48 |
| 44756.114583333336 | 7.45 |
| 44756.125 | 7.45 |
| 44756.135416666664 | 7.42 |
| 44756.145833333336 | 7.4 |
| 44756.15625 | 7.39 |
| 44756.166666666664 | 7.38 |
| 44756.177083333336 | 7.37 |
| 44756.1875 | 7.36 |
| 44756.197916666664 | 7.34 |
| 44756.208333333336 | 7.34 |
| 44756.21875 | 7.29 |
| 44756.229166666664 | 7.32 |
| 44756.239583333336 | 7.35 |
| 44756.25 | 7.37 |
| 44756.260416666664 | 7.36 |
| 44756.270833333336 | 7.34 |
| 44756.28125 | 7.33 |
| 44756.291666666664 | 7.31 |
| 44756.302083333336 | 7.28 |
| 44756.3125 | 7.24 |
| 44756.322916666664 | 7.23 |
| 44756.333333333336 | 7.21 |
| 44756.34375 | 7.2 |
| 44756.354166666664 | 7.22 |
| 44756.364583333336 | 7.22 |
| 44756.375 | 7.24 |
| 44756.385416666664 | 7.25 |
| 44756.395833333336 | 7.28 |
| 44756.40625 | 7.3 |
| 44756.416666666664 | 7.31 |
| 44756.427083333336 | 7.32 |
| 44756.4375 | 7.34 |
| 44756.447916666664 | 7.35 |
| 44756.458333333336 | 7.36 |
| 44756.46875 | 7.36 |
| 44756.479166666664 | 7.37 |
| 44756.489583333336 | 7.37 |
| 44756.5 | 7.39 |
| 44756.510416666664 | 7.41 |
| 44756.520833333336 | 7.42 |
| 44756.53125 | 7.43 |
| 44756.541666666664 | 7.44 |
| 44756.552083333336 | 7.44 |
| 44756.5625 | 7.44 |
| 44756.572916666664 | 7.44 |
| 44756.583333333336 | 7.42 |
| 44756.59375 | 7.42 |
| 44756.604166666664 | 7.43 |
| 44756.614583333336 | 7.44 |
| 44756.625 | 7.43 |
| 44756.635416666664 | 7.44 |
| 44756.645833333336 | 7.45 |
| 44756.65625 | 7.46 |
| 44756.666666666664 | 7.46 |
| 44756.677083333336 | 7.46 |
| 44756.6875 | 7.46 |
| 44756.697916666664 | 7.46 |
| 44756.708333333336 | 7.45 |
| 44756.71875 | 7.46 |
| 44756.729166666664 | 7.47 |
| 44756.739583333336 | 7.47 |
| 44756.75 | 7.46 |
| 44756.760416666664 | 7.46 |
| 44756.770833333336 | 7.45 |
| 44756.78125 | 7.45 |
| 44756.791666666664 | 7.45 |
| 44756.802083333336 | 7.45 |
| 44756.8125 | 7.45 |
| 44756.822916666664 | 7.44 |
| 44756.833333333336 | 7.47 |
| 44756.84375 | 7.45 |
| 44756.854166666664 | 7.45 |
| 44756.864583333336 | 7.45 |
| 44756.875 | 7.43 |
| 44756.885416666664 | 7.43 |
| 44756.895833333336 | 7.44 |
| 44756.90625 | 7.45 |
| 44756.916666666664 | 7.46 |
| 44756.927083333336 | 7.47 |
| 44756.9375 | 7.47 |
| 44756.947916666664 | 7.46 |
| 44756.958333333336 | 7.47 |
| 44756.96875 | 7.48 |
| 44756.979166666664 | 7.49 |
| 44756.989583333336 | 7.49 |
| 44757.0 | 7.5 |
| 44757.010416666664 | 7.51 |
| 44757.020833333336 | 7.51 |
| 44757.03125 | 7.5 |
| 44757.041666666664 | 7.49 |
| 44757.052083333336 | 7.49 |
| 44757.0625 | 7.48 |
| 44757.072916666664 | 7.48 |
| 44757.083333333336 | 7.48 |
| 44757.09375 | 7.48 |
| 44757.104166666664 | 7.49 |
| 44757.114583333336 | 7.47 |
| 44757.125 | 7.46 |
| 44757.135416666664 | 7.46 |
| 44757.145833333336 | 7.47 |
| 44757.15625 | 7.45 |
| 44757.166666666664 | 7.43 |
| 44757.177083333336 | 7.43 |
| 44757.1875 | 7.41 |
| 44757.197916666664 | 7.4 |
| 44757.208333333336 | 7.36 |
| 44757.21875 | 7.34 |
| 44757.229166666664 | 7.32 |
| 44757.239583333336 | 7.3 |
| 44757.25 | 7.29 |
| 44757.260416666664 | 7.27 |
| 44757.270833333336 | 7.26 |
| 44757.28125 | 7.31 |
| 44757.291666666664 | 7.35 |
| 44757.302083333336 | 7.34 |
| 44757.3125 | 7.33 |
| 44757.322916666664 | 7.32 |
| 44757.333333333336 | 7.29 |
| 44757.34375 | 7.27 |
| 44757.354166666664 | 7.24 |
| 44757.364583333336 | 7.22 |
| 44757.375 | 7.22 |
| 44757.385416666664 | 7.23 |
| 44757.395833333336 | 7.23 |
| 44757.40625 | 7.24 |
| 44757.416666666664 | 7.26 |
| 44757.427083333336 | 7.28 |
| 44757.4375 | 7.29 |
| 44757.447916666664 | 7.29 |
| 44757.458333333336 | 7.3 |
| 44757.46875 | 7.31 |
| 44757.479166666664 | 7.32 |
| 44757.489583333336 | 7.33 |
| 44757.5 | 7.34 |
| 44757.510416666664 | 7.35 |
| 44757.520833333336 | 7.35 |
| 44757.53125 | 7.37 |
| 44757.541666666664 | 7.39 |
| 44757.552083333336 | 7.4 |
| 44757.5625 | 7.41 |
| 44757.572916666664 | 7.41 |
| 44757.583333333336 | 7.41 |
| 44757.59375 | 7.43 |
| 44757.604166666664 | 7.42 |
| 44757.614583333336 | 7.41 |
| 44757.625 | 7.4 |
| 44757.635416666664 | 7.39 |
| 44757.645833333336 | 7.41 |
| 44757.65625 | 7.43 |
| 44757.666666666664 | 7.44 |
| 44757.677083333336 | 7.45 |
| 44757.6875 | 7.45 |
| 44757.697916666664 | 7.45 |
| 44757.708333333336 | 7.45 |
| 44757.71875 | 7.45 |
| 44757.729166666664 | 7.44 |
| 44757.739583333336 | 7.44 |
| 44757.75 | 7.44 |
| 44757.760416666664 | 7.44 |
| 44757.770833333336 | 7.44 |
| 44757.78125 | 7.45 |
| 44757.791666666664 | 7.46 |
| 44757.802083333336 | 7.45 |
| 44757.8125 | 7.43 |
| 44757.822916666664 | 7.4 |
| 44757.833333333336 | 7.39 |
| 44757.84375 | 7.38 |
| 44757.854166666664 | 7.37 |
| 44757.864583333336 | 7.36 |
| 44757.875 | 7.36 |
| 44757.885416666664 | 7.37 |
| 44757.895833333336 | 7.36 |
| 44757.90625 | 7.37 |
| 44757.916666666664 | 7.38 |
| 44757.927083333336 | 7.39 |
| 44757.9375 | 7.4 |
| 44757.947916666664 | 7.41 |
| 44757.958333333336 | 7.41 |
| 44757.96875 | 7.42 |
| 44757.979166666664 | 7.42 |
| 44757.989583333336 | 7.42 |
| 44758.0 | 7.42 |
| 44758.010416666664 | 7.42 |
| 44758.020833333336 | 7.44 |
| 44758.03125 | 7.44 |
| 44758.041666666664 | 7.44 |
| 44758.052083333336 | 7.45 |
| 44758.0625 | 7.45 |
| 44758.072916666664 | 7.44 |
| 44758.083333333336 | 7.44 |
| 44758.09375 | 7.43 |
| 44758.104166666664 | 7.42 |
| 44758.114583333336 | 7.42 |
| 44758.125 | 7.43 |
| 44758.135416666664 | 7.44 |
| 44758.145833333336 | 7.43 |
| 44758.15625 | 7.41 |
| 44758.166666666664 | 7.41 |
| 44758.177083333336 | 7.41 |
| 44758.1875 | 7.41 |
| 44758.197916666664 | 7.4 |
| 44758.208333333336 | 7.38 |
| 44758.21875 | 7.35 |
| 44758.229166666664 | 7.33 |
| 44758.239583333336 | 7.34 |
| 44758.25 | 7.29 |
| 44758.260416666664 | 7.28 |
| 44758.270833333336 | 7.25 |
| 44758.28125 | 7.23 |
| 44758.291666666664 | 7.25 |
| 44758.302083333336 | 7.25 |
| 44758.3125 | 7.24 |
| 44758.322916666664 | 7.26 |
| 44758.333333333336 | 7.27 |
| 44758.34375 | 7.25 |
| 44758.354166666664 | 7.24 |
| 44758.364583333336 | 7.23 |
| 44758.375 | 7.2 |
| 44758.385416666664 | 7.18 |
| 44758.395833333336 | 7.16 |
| 44758.40625 | 7.15 |
| 44758.416666666664 | 7.14 |
| 44758.427083333336 | 7.15 |
| 44758.4375 | 7.16 |
| 44758.447916666664 | 7.17 |
| 44758.458333333336 | 7.18 |
| 44758.46875 | 7.2 |
| 44758.479166666664 | 7.22 |
| 44758.489583333336 | 7.24 |
| 44758.5 | 7.26 |
| 44758.510416666664 | 7.27 |
| 44758.520833333336 | 7.28 |
| 44758.53125 | 7.29 |
| 44758.541666666664 | 7.29 |
| 44758.552083333336 | 7.3 |
| 44758.5625 | 7.32 |
| 44758.572916666664 | 7.34 |
| 44758.583333333336 | 7.36 |
| 44758.59375 | 7.36 |
| 44758.604166666664 | 7.38 |
| 44758.614583333336 | 7.39 |
| 44758.625 | 7.39 |
| 44758.635416666664 | 7.39 |
| 44758.645833333336 | 7.39 |
| 44758.65625 | 7.36 |
| 44758.666666666664 | 7.35 |
| 44758.677083333336 | 7.38 |
| 44758.6875 | 7.44 |
| 44758.697916666664 | 7.44 |
| 44758.708333333336 | 7.44 |
| 44758.71875 | 7.45 |
| 44758.729166666664 | 7.45 |
| 44758.739583333336 | 7.45 |
| 44758.75 | 7.45 |
| 44758.760416666664 | 7.46 |
| 44758.770833333336 | 7.46 |
| 44758.78125 | 7.47 |
| 44758.791666666664 | 7.46 |
| 44758.802083333336 | 7.45 |
| 44758.8125 | 7.45 |
| 44758.822916666664 | 7.45 |
| 44758.833333333336 | 7.45 |
| 44758.84375 | 7.45 |
| 44758.854166666664 | 7.45 |
| 44758.864583333336 | 7.44 |
| 44758.875 | 7.44 |
| 44758.885416666664 | 7.44 |
| 44758.895833333336 | 7.44 |
| 44758.90625 | 7.45 |
| 44758.916666666664 | 7.44 |
| 44758.927083333336 | 7.42 |
| 44758.9375 | 7.41 |
| 44758.947916666664 | 7.4 |
| 44758.958333333336 | 7.4 |
| 44758.96875 | 7.42 |
| 44758.979166666664 | 7.43 |
| 44758.989583333336 | 7.44 |
| 44759.0 | 7.45 |
| 44759.010416666664 | 7.45 |
| 44759.020833333336 | 7.45 |
| 44759.03125 | 7.45 |
| 44759.041666666664 | 7.45 |
| 44759.052083333336 | 7.46 |
| 44759.0625 | 7.47 |
| 44759.072916666664 | 7.47 |
| 44759.083333333336 | 7.47 |
| 44759.09375 | 7.47 |
| 44759.104166666664 | 7.47 |
| 44759.114583333336 | 7.47 |
| 44759.125 | 7.47 |
| 44759.135416666664 | 7.46 |
| 44759.145833333336 | 7.46 |
| 44759.15625 | 7.45 |
| 44759.166666666664 | 7.45 |
| 44759.177083333336 | 7.44 |
| 44759.1875 | 7.42 |
| 44759.197916666664 | 7.43 |
| 44759.208333333336 | 7.43 |
| 44759.21875 | 7.42 |
| 44759.229166666664 | 7.4 |
| 44759.239583333336 | 7.4 |
| 44759.25 | 7.38 |
| 44759.260416666664 | 7.39 |
| 44759.270833333336 | 7.37 |
| 44759.28125 | 7.37 |
| 44759.291666666664 | 7.34 |
| 44759.302083333336 | 7.3 |
| 44759.3125 | 7.28 |
| 44759.322916666664 | 7.25 |
| 44759.333333333336 | 7.26 |
| 44759.34375 | 7.27 |
| 44759.354166666664 | 7.25 |
| 44759.364583333336 | 7.3 |
| 44759.375 | 7.3 |
| 44759.385416666664 | 7.3 |
| 44759.395833333336 | 7.28 |
| 44759.40625 | 7.26 |
| 44759.416666666664 | 7.24 |
| 44759.427083333336 | 7.23 |
| 44759.4375 | 7.22 |
| 44759.447916666664 | 7.22 |
| 44759.458333333336 | 7.22 |
| 44759.46875 | 7.22 |
| 44759.479166666664 | 7.24 |
| 44759.489583333336 | 7.25 |
| 44759.5 | 7.26 |
| 44759.510416666664 | 7.27 |
| 44759.520833333336 | 7.27 |
| 44759.53125 | 7.29 |
| 44759.541666666664 | 7.3 |
| 44759.552083333336 | 7.31 |
| 44759.5625 | 7.32 |
| 44759.572916666664 | 7.33 |
| 44759.583333333336 | 7.34 |
| 44759.59375 | 7.35 |
| 44759.604166666664 | 7.36 |
| 44759.614583333336 | 7.39 |
| 44759.625 | 7.42 |
| 44759.635416666664 | 7.44 |
| 44759.645833333336 | 7.43 |
| 44759.65625 | 7.44 |
| 44759.666666666664 | 7.43 |
| 44759.677083333336 | 7.44 |
| 44759.6875 | 7.44 |
| 44759.697916666664 | 7.44 |
| 44759.708333333336 | 7.4 |
| 44759.71875 | 7.43 |
| 44759.729166666664 | 7.48 |
| 44759.739583333336 | 7.49 |
| 44759.75 | 7.51 |
| 44759.760416666664 | 7.52 |
| 44759.770833333336 | 7.53 |
| 44759.78125 | 7.54 |
| 44759.791666666664 | 7.53 |
| 44759.802083333336 | 7.54 |
| 44759.8125 | 7.55 |
| 44759.822916666664 | 7.55 |
| 44759.833333333336 | 7.54 |
| 44759.84375 | 7.55 |
| 44759.854166666664 | 7.56 |
| 44759.864583333336 | 7.56 |
| 44759.875 | 7.56 |
| 44759.885416666664 | 7.57 |
| 44759.895833333336 | 7.57 |
| 44759.90625 | 7.57 |
| 44759.916666666664 | 7.57 |
| 44759.927083333336 | 7.57 |
| 44759.9375 | 7.58 |
| 44759.947916666664 | 7.58 |
| 44759.958333333336 | 7.55 |
| 44759.96875 | 7.54 |
| 44759.979166666664 | 7.52 |
| 44759.989583333336 | 7.52 |
| 44760.0 | 7.52 |
| 44760.010416666664 | 7.52 |
| 44760.020833333336 | 7.52 |
| 44760.03125 | 7.51 |
| 44760.041666666664 | 7.51 |
| 44760.052083333336 | 7.51 |
| 44760.0625 | 7.51 |
| 44760.072916666664 | 7.51 |
| 44760.083333333336 | 7.52 |
| 44760.09375 | 7.52 |
| 44760.104166666664 | 7.52 |
| 44760.114583333336 | 7.51 |
| 44760.125 | 7.51 |
| 44760.135416666664 | 7.5 |
| 44760.145833333336 | 7.5 |
| 44760.15625 | 7.49 |
| 44760.166666666664 | 7.49 |
| 44760.177083333336 | 7.49 |
| 44760.1875 | 7.48 |
| 44760.197916666664 | 7.48 |
| 44760.208333333336 | 7.48 |
| 44760.21875 | 7.47 |
| 44760.229166666664 | 7.46 |
| 44760.239583333336 | 7.47 |
| 44760.25 | 7.46 |
| 44760.260416666664 | 7.45 |
| 44760.270833333336 | 7.44 |
| 44760.28125 | 7.42 |
| 44760.291666666664 | 7.41 |
| 44760.302083333336 | 7.38 |
| 44760.3125 | 7.37 |
| 44760.322916666664 | 7.33 |
| 44760.333333333336 | 7.32 |
| 44760.34375 | 7.39 |
| 44760.354166666664 | 7.38 |
| 44760.364583333336 | 7.4 |
| 44760.375 | 7.42 |
| 44760.385416666664 | 7.41 |
| 44760.395833333336 | 7.41 |
| 44760.40625 | 7.39 |
| 44760.416666666664 | 7.39 |
| 44760.427083333336 | 7.38 |
| 44760.4375 | 7.37 |
| 44760.447916666664 | 7.36 |
| 44760.458333333336 | 7.35 |
| 44760.46875 | 7.34 |
| 44760.479166666664 | 7.35 |
| 44760.489583333336 | 7.34 |
| 44760.5 | 7.33 |
| 44760.510416666664 | 7.34 |
| 44760.520833333336 | 7.34 |
| 44760.53125 | 7.36 |
| 44760.541666666664 | 7.37 |
| 44760.552083333336 | 7.39 |
| 44760.5625 | 7.4 |
| 44760.572916666664 | 7.4 |
| 44760.583333333336 | 7.41 |
| 44760.59375 | 7.41 |
| 44760.604166666664 | 7.42 |
| 44760.614583333336 | 7.43 |
| 44760.625 | 7.44 |
| 44760.635416666664 | 7.45 |
| 44760.645833333336 | 7.47 |
| 44760.65625 | 7.48 |
| 44760.666666666664 | 7.49 |
| 44760.677083333336 | 7.5 |
| 44760.6875 | 7.51 |
| 44760.697916666664 | 7.51 |
| 44760.708333333336 | 7.52 |
| 44760.71875 | 7.52 |
| 44760.729166666664 | 7.52 |
| 44760.739583333336 | 7.53 |
| 44760.75 | 7.5 |
| 44760.760416666664 | 7.53 |
| 44760.770833333336 | 7.55 |
| 44760.78125 | 7.59 |
| 44760.791666666664 | 7.61 |
| 44760.802083333336 | 7.63 |
| 44760.8125 | 7.62 |
| 44760.822916666664 | 7.62 |
| 44760.833333333336 | 7.62 |
| 44760.84375 | 7.63 |
| 44760.854166666664 | 7.63 |
| 44760.864583333336 | 7.62 |
| 44760.875 | 7.63 |
| 44760.885416666664 | 7.65 |
| 44760.895833333336 | 7.65 |
| 44760.90625 | 7.66 |
| 44760.916666666664 | 7.66 |
| 44760.927083333336 | 7.67 |
| 44760.9375 | 7.67 |
| 44760.947916666664 | 7.67 |
| 44760.958333333336 | 7.67 |
| 44760.96875 | 7.67 |
| 44760.979166666664 | 7.67 |
| 44760.989583333336 | 7.66 |
| 44761.0 | 7.64 |
| 44761.010416666664 | 7.62 |
| 44761.020833333336 | 7.61 |
| 44761.03125 | 7.6 |
| 44761.041666666664 | 7.6 |
| 44761.052083333336 | 7.6 |
| 44761.0625 | 7.59 |
| 44761.072916666664 | 7.58 |
| 44761.083333333336 | 7.58 |
| 44761.09375 | 7.57 |
| 44761.104166666664 | 7.56 |
| 44761.114583333336 | 7.56 |
| 44761.125 | 7.56 |
| 44761.135416666664 | 7.55 |
| 44761.145833333336 | 7.55 |
| 44761.15625 | 7.55 |
| 44761.166666666664 | 7.55 |
| 44761.177083333336 | 7.55 |
| 44761.1875 | 7.54 |
| 44761.197916666664 | 7.54 |
| 44761.208333333336 | 7.54 |
| 44761.21875 | 7.53 |
| 44761.229166666664 | 7.53 |
| 44761.239583333336 | 7.53 |
| 44761.25 | 7.53 |
| 44761.260416666664 | 7.5 |
| 44761.270833333336 | 7.51 |
| 44761.28125 | 7.53 |
| 44761.291666666664 | 7.53 |
| 44761.302083333336 | 7.53 |
| 44761.3125 | 7.47 |
| 44761.322916666664 | 7.45 |
| 44761.333333333336 | 7.45 |
| 44761.34375 | 7.43 |
| 44761.354166666664 | 7.4 |
| 44761.364583333336 | 7.46 |
| 44761.375 | 7.45 |
| 44761.385416666664 | 7.46 |
| 44761.395833333336 | 7.47 |
| 44761.40625 | 7.46 |
| 44761.416666666664 | 7.46 |
| 44761.427083333336 | 7.45 |
| 44761.4375 | 7.45 |
| 44761.447916666664 | 7.44 |
| 44761.458333333336 | 7.44 |
| 44761.46875 | 7.43 |
| 44761.479166666664 | 7.43 |
| 44761.489583333336 | 7.43 |
| 44761.5 | 7.42 |
| 44761.510416666664 | 7.42 |
| 44761.520833333336 | 7.41 |
| 44761.53125 | 7.41 |
| 44761.541666666664 | 7.4 |
| 44761.552083333336 | 7.41 |
| 44761.5625 | 7.41 |
| 44761.572916666664 | 7.42 |
| 44761.583333333336 | 7.42 |
| 44761.59375 | 7.42 |
| 44761.604166666664 | 7.43 |
| 44761.614583333336 | 7.43 |
| 44761.625 | 7.45 |
| 44761.635416666664 | 7.45 |
| 44761.645833333336 | 7.46 |
| 44761.65625 | 7.47 |
| 44761.666666666664 | 7.49 |
| 44761.677083333336 | 7.51 |
| 44761.6875 | 7.53 |
| 44761.697916666664 | 7.54 |
| 44761.708333333336 | 7.54 |
| 44761.71875 | 7.54 |
| 44761.729166666664 | 7.55 |
| 44761.739583333336 | 7.55 |
| 44761.75 | 7.56 |
| 44761.760416666664 | 7.56 |
| 44761.770833333336 | 7.55 |
| 44761.78125 | 7.54 |
| 44761.791666666664 | 7.57 |
| 44761.802083333336 | 7.61 |
| 44761.8125 | 7.6 |
| 44761.822916666664 | 7.62 |
| 44761.833333333336 | 7.63 |
| 44761.84375 | 7.63 |
| 44761.854166666664 | 7.63 |
| 44761.864583333336 | 7.62 |
| 44761.875 | 7.64 |
| 44761.885416666664 | 7.63 |
| 44761.895833333336 | 7.64 |
| 44761.90625 | 7.63 |
| 44761.916666666664 | 7.65 |
| 44761.927083333336 | 7.67 |
| 44761.9375 | 7.68 |
| 44761.947916666664 | 7.68 |
| 44761.958333333336 | 7.72 |
| 44761.96875 | 7.74 |
| 44761.979166666664 | 7.77 |
| 44761.989583333336 | 7.79 |
| 44762.0 | 7.78 |
| 44762.010416666664 | 7.79 |
| 44762.020833333336 | 7.79 |
| 44762.03125 | 7.78 |
| 44762.041666666664 | 7.76 |
| 44762.052083333336 | 7.74 |
| 44762.0625 | 7.73 |
| 44762.072916666664 | 7.72 |
| 44762.083333333336 | 7.7 |
| 44762.09375 | 7.68 |
| 44762.104166666664 | 7.65 |
| 44762.114583333336 | 7.62 |
| 44762.125 | 7.59 |
| 44762.135416666664 | 7.58 |
| 44762.145833333336 | 7.57 |
| 44762.15625 | 7.56 |
| 44762.166666666664 | 7.55 |
| 44762.177083333336 | 7.55 |
| 44762.1875 | 7.54 |
| 44762.197916666664 | 7.53 |
| 44762.208333333336 | 7.53 |
| 44762.21875 | 7.52 |
| 44762.229166666664 | 7.52 |
| 44762.239583333336 | 7.51 |
| 44762.25 | 7.51 |
| 44762.260416666664 | 7.51 |
| 44762.270833333336 | 7.51 |
| 44762.28125 | 7.5 |
| 44762.291666666664 | 7.47 |
| 44762.302083333336 | 7.48 |
| 44762.3125 | 7.48 |
| 44762.322916666664 | 7.46 |
| 44762.333333333336 | 7.44 |
| 44762.34375 | 7.43 |
| 44762.354166666664 | 7.41 |
| 44762.364583333336 | 7.4 |
| 44762.375 | 7.39 |
| 44762.385416666664 | 7.38 |
| 44762.395833333336 | 7.39 |
| 44762.40625 | 7.45 |
| 44762.416666666664 | 7.42 |
| 44762.427083333336 | 7.47 |
| 44762.4375 | 7.47 |
| 44762.447916666664 | 7.48 |
| 44762.458333333336 | 7.47 |
| 44762.46875 | 7.47 |
| 44762.479166666664 | 7.47 |
| 44762.489583333336 | 7.47 |
| 44762.5 | 7.46 |
| 44762.510416666664 | 7.46 |
| 44762.520833333336 | 7.46 |
| 44762.53125 | 7.46 |
| 44762.541666666664 | 7.45 |
| 44762.552083333336 | 7.44 |
| 44762.5625 | 7.44 |
| 44762.572916666664 | 7.43 |
| 44762.583333333336 | 7.43 |
| 44762.59375 | 7.44 |
| 44762.604166666664 | 7.44 |
| 44762.614583333336 | 7.43 |
| 44762.625 | 7.44 |
| 44762.635416666664 | 7.45 |
| 44762.645833333336 | 7.45 |
| 44762.65625 | 7.47 |
| 44762.666666666664 | 7.47 |
| 44762.677083333336 | 7.47 |
| 44762.6875 | 7.48 |
| 44762.697916666664 | 7.48 |
| 44762.708333333336 | 7.49 |
| 44762.71875 | 7.52 |
| 44762.729166666664 | 7.52 |
| 44762.739583333336 | 7.55 |
| 44762.75 | 7.55 |
| 44762.760416666664 | 7.55 |
| 44762.770833333336 | 7.57 |
| 44762.78125 | 7.57 |
| 44762.791666666664 | 7.57 |
| 44762.802083333336 | 7.58 |
| 44762.8125 | 7.59 |
| 44762.822916666664 | 7.54 |
| 44762.833333333336 | 7.57 |
| 44762.84375 | 7.62 |
| 44762.854166666664 | 7.66 |
| 44762.864583333336 | 7.66 |
| 44762.875 | 7.67 |
| 44762.885416666664 | 7.65 |
| 44762.895833333336 | 7.65 |
| 44762.90625 | 7.65 |
| 44762.916666666664 | 7.64 |
| 44762.927083333336 | 7.63 |
| 44762.9375 | 7.62 |
| 44762.947916666664 | 7.62 |
| 44762.958333333336 | 7.62 |
| 44762.96875 | 7.64 |
| 44762.979166666664 | 7.66 |
| 44762.989583333336 | 7.68 |
| 44763.0 | 7.69 |
| 44763.010416666664 | 7.69 |
| 44763.020833333336 | 7.69 |
| 44763.03125 | 7.7 |
| 44763.041666666664 | 7.7 |
| 44763.052083333336 | 7.7 |
| 44763.0625 | 7.69 |
| 44763.072916666664 | 7.69 |
| 44763.083333333336 | 7.66 |
| 44763.09375 | 7.64 |
| 44763.104166666664 | 7.64 |
| 44763.114583333336 | 7.63 |
| 44763.125 | 7.61 |
| 44763.135416666664 | 7.61 |
| 44763.145833333336 | 7.6 |
| 44763.15625 | 7.59 |
| 44763.166666666664 | 7.57 |
| 44763.177083333336 | 7.57 |
| 44763.1875 | 7.56 |
| 44763.197916666664 | 7.55 |
| 44763.208333333336 | 7.55 |
| 44763.21875 | 7.55 |
| 44763.229166666664 | 7.54 |
| 44763.239583333336 | 7.54 |
| 44763.25 | 7.53 |
| 44763.260416666664 | 7.53 |
| 44763.270833333336 | 7.52 |
| 44763.28125 | 7.52 |
| 44763.291666666664 | 7.52 |
| 44763.302083333336 | 7.51 |
| 44763.3125 | 7.51 |
| 44763.322916666664 | 7.48 |
| 44763.333333333336 | 7.48 |
| 44763.34375 | 7.49 |
| 44763.354166666664 | 7.49 |
| 44763.364583333336 | 7.48 |
| 44763.375 | 7.48 |
| 44763.385416666664 | 7.48 |
| 44763.395833333336 | 7.43 |
| 44763.40625 | 7.45 |
| 44763.416666666664 | 7.46 |
| 44763.427083333336 | 7.43 |
| 44763.4375 | 7.44 |
| 44763.447916666664 | 7.47 |
| 44763.458333333336 | 7.48 |
| 44763.46875 | 7.48 |
| 44763.479166666664 | 7.48 |
| 44763.489583333336 | 7.48 |
| 44763.5 | 7.48 |
| 44763.510416666664 | 7.48 |
| 44763.520833333336 | 7.48 |
| 44763.53125 | 7.48 |
| 44763.541666666664 | 7.49 |
| 44763.552083333336 | 7.49 |
| 44763.5625 | 7.5 |
| 44763.572916666664 | 7.48 |
| 44763.583333333336 | 7.48 |
| 44763.59375 | 7.47 |
| 44763.604166666664 | 7.46 |
| 44763.614583333336 | 7.45 |
| 44763.625 | 7.45 |
| 44763.635416666664 | 7.46 |
| 44763.645833333336 | 7.47 |
| 44763.65625 | 7.49 |
| 44763.666666666664 | 7.49 |
| 44763.677083333336 | 7.5 |
| 44763.6875 | 7.51 |
| 44763.697916666664 | 7.52 |
| 44763.708333333336 | 7.54 |
| 44763.71875 | 7.55 |
| 44763.729166666664 | 7.56 |
| 44763.739583333336 | 7.57 |
| 44763.75 | 7.58 |
| 44763.760416666664 | 7.59 |
| 44763.770833333336 | 7.6 |
| 44763.78125 | 7.61 |
| 44763.791666666664 | 7.6 |
| 44763.802083333336 | 7.61 |
| 44763.8125 | 7.61 |
| 44763.822916666664 | 7.61 |
| 44763.833333333336 | 7.61 |
| 44763.84375 | 7.61 |
| 44763.854166666664 | 7.61 |
| 44763.864583333336 | 7.62 |
| 44763.875 | 7.62 |
| 44763.885416666664 | 7.64 |
| 44763.895833333336 | 7.65 |
| 44763.90625 | 7.63 |
| 44763.916666666664 | 7.65 |
| 44763.927083333336 | 7.65 |
| 44763.9375 | 7.63 |
| 44763.947916666664 | 7.62 |
| 44763.958333333336 | 7.61 |
| 44763.96875 | 7.6 |
| 44763.979166666664 | 7.6 |
| 44763.989583333336 | 7.59 |
| 44764.0 | 7.6 |
| 44764.010416666664 | 7.64 |
| 44764.020833333336 | 7.67 |
| 44764.03125 | 7.67 |
| 44764.041666666664 | 7.67 |
| 44764.052083333336 | 7.67 |
| 44764.0625 | 7.66 |
| 44764.072916666664 | 7.66 |
| 44764.083333333336 | 7.66 |
| 44764.09375 | 7.66 |
| 44764.104166666664 | 7.66 |
| 44764.114583333336 | 7.65 |
| 44764.125 | 7.63 |
| 44764.135416666664 | 7.61 |
| 44764.145833333336 | 7.61 |
| 44764.15625 | 7.59 |
| 44764.166666666664 | 7.58 |
| 44764.177083333336 | 7.58 |
| 44764.1875 | 7.57 |
| 44764.197916666664 | 7.56 |
| 44764.208333333336 | 7.55 |
| 44764.21875 | 7.54 |
| 44764.229166666664 | 7.53 |
| 44764.239583333336 | 7.52 |
| 44764.25 | 7.52 |
| 44764.260416666664 | 7.51 |
| 44764.270833333336 | 7.5 |
| 44764.28125 | 7.51 |
| 44764.291666666664 | 7.51 |
| 44764.302083333336 | 7.51 |
| 44764.3125 | 7.51 |
| 44764.322916666664 | 7.5 |
| 44764.333333333336 | 7.49 |
| 44764.34375 | 7.48 |
| 44764.354166666664 | 7.48 |
| 44764.364583333336 | 7.41 |
| 44764.375 | 7.43 |
| 44764.385416666664 | 7.42 |
| 44764.395833333336 | 7.46 |
| 44764.40625 | 7.48 |
| 44764.416666666664 | 7.46 |
| 44764.427083333336 | 7.47 |
| 44764.4375 | 7.46 |
| 44764.447916666664 | 7.48 |
| 44764.458333333336 | 7.47 |
| 44764.46875 | 7.44 |
| 44764.479166666664 | 7.45 |
| 44764.489583333336 | 7.46 |
| 44764.5 | 7.45 |
| 44764.510416666664 | 7.44 |
| 44764.520833333336 | 7.44 |
| 44764.53125 | 7.45 |
| 44764.541666666664 | 7.44 |
| 44764.552083333336 | 7.45 |
| 44764.5625 | 7.45 |
| 44764.572916666664 | 7.44 |
| 44764.583333333336 | 7.45 |
| 44764.59375 | 7.45 |
| 44764.604166666664 | 7.47 |
| 44764.614583333336 | 7.46 |
| 44764.625 | 7.45 |
| 44764.635416666664 | 7.44 |
| 44764.645833333336 | 7.44 |
| 44764.65625 | 7.45 |
| 44764.666666666664 | 7.45 |
| 44764.677083333336 | 7.46 |
| 44764.6875 | 7.48 |
| 44764.697916666664 | 7.49 |
| 44764.708333333336 | 7.49 |
| 44764.71875 | 7.5 |
| 44764.729166666664 | 7.5 |
| 44764.739583333336 | 7.51 |
| 44764.75 | 7.52 |
| 44764.760416666664 | 7.54 |
| 44764.770833333336 | 7.54 |
| 44764.78125 | 7.55 |
| 44764.791666666664 | 7.56 |
| 44764.802083333336 | 7.57 |
| 44764.8125 | 7.57 |
| 44764.822916666664 | 7.58 |
| 44764.833333333336 | 7.58 |
| 44764.84375 | 7.58 |
| 44764.854166666664 | 7.58 |
| 44764.864583333336 | 7.58 |
| 44764.875 | 7.59 |
| 44764.885416666664 | 7.58 |
| 44764.895833333336 | 7.55 |
| 44764.90625 | 7.55 |
| 44764.916666666664 | 7.53 |
| 44764.927083333336 | 7.57 |
| 44764.9375 | 7.6 |
| 44764.947916666664 | 7.61 |
| 44764.958333333336 | 7.6 |
| 44764.96875 | 7.59 |
| 44764.979166666664 | 7.59 |
| 44764.989583333336 | 7.58 |
| 44765.0 | 7.56 |
| 44765.010416666664 | 7.52 |
| 44765.020833333336 | 7.53 |
| 44765.03125 | 7.52 |
| 44765.041666666664 | 7.54 |
| 44765.052083333336 | 7.59 |
| 44765.0625 | 7.6 |
| 44765.072916666664 | 7.61 |
| 44765.083333333336 | 7.62 |
| 44765.09375 | 7.63 |
| 44765.104166666664 | 7.63 |
| 44765.114583333336 | 7.63 |
| 44765.125 | 7.62 |
| 44765.135416666664 | 7.62 |
| 44765.145833333336 | 7.6 |
| 44765.15625 | 7.58 |
| 44765.166666666664 | 7.57 |
| 44765.177083333336 | 7.56 |
| 44765.1875 | 7.55 |
| 44765.197916666664 | 7.53 |
| 44765.208333333336 | 7.52 |
| 44765.21875 | 7.52 |
| 44765.229166666664 | 7.51 |
| 44765.239583333336 | 7.51 |
| 44765.25 | 7.5 |
| 44765.260416666664 | 7.5 |
| 44765.270833333336 | 7.49 |
| 44765.28125 | 7.49 |
| 44765.291666666664 | 7.48 |
| 44765.302083333336 | 7.47 |
| 44765.3125 | 7.47 |
| 44765.322916666664 | 7.47 |
| 44765.333333333336 | 7.46 |
| 44765.34375 | 7.46 |
| 44765.354166666664 | 7.46 |
| 44765.364583333336 | 7.45 |
| 44765.375 | 7.45 |
| 44765.385416666664 | 7.44 |
| 44765.395833333336 | 7.43 |
| 44765.40625 | 7.42 |
| 44765.416666666664 | 7.42 |
| 44765.427083333336 | 7.41 |
| 44765.4375 | 7.41 |
| 44765.447916666664 | 7.41 |
| 44765.458333333336 | 7.38 |
| 44765.46875 | 7.38 |
| 44765.479166666664 | 7.39 |
| 44765.489583333336 | 7.39 |
| 44765.5 | 7.38 |
| 44765.510416666664 | 7.38 |
| 44765.520833333336 | 7.39 |
| 44765.53125 | 7.42 |
| 44765.541666666664 | 7.43 |
| 44765.552083333336 | 7.42 |
| 44765.5625 | 7.43 |
| 44765.572916666664 | 7.43 |
| 44765.583333333336 | 7.42 |
| 44765.59375 | 7.43 |
| 44765.604166666664 | 7.45 |
| 44765.614583333336 | 7.46 |
| 44765.625 | 7.45 |
| 44765.635416666664 | 7.44 |
| 44765.645833333336 | 7.5 |
| 44765.65625 | 7.5 |
| 44765.666666666664 | 7.47 |
| 44765.677083333336 | 7.47 |
| 44765.6875 | 7.47 |
| 44765.697916666664 | 7.47 |
| 44765.708333333336 | 7.48 |
| 44765.71875 | 7.46 |
| 44765.729166666664 | 7.48 |
| 44765.739583333336 | 7.5 |
| 44765.75 | 7.5 |
| 44765.760416666664 | 7.51 |
| 44765.770833333336 | 7.51 |
| 44765.78125 | 7.5 |
| 44765.791666666664 | 7.5 |
| 44765.802083333336 | 7.51 |
| 44765.8125 | 7.52 |
| 44765.822916666664 | 7.52 |
| 44765.833333333336 | 7.53 |
| 44765.84375 | 7.55 |
| 44765.854166666664 | 7.56 |
| 44765.864583333336 | 7.57 |
| 44765.875 | 7.58 |
| 44765.885416666664 | 7.57 |
| 44765.895833333336 | 7.57 |
| 44765.90625 | 7.57 |
| 44765.916666666664 | 7.57 |
| 44765.927083333336 | 7.55 |
| 44765.9375 | 7.53 |
| 44765.947916666664 | 7.53 |
| 44765.958333333336 | 7.55 |
| 44765.96875 | 7.58 |
| 44765.979166666664 | 7.58 |
| 44765.989583333336 | 7.57 |
| 44766.0 | 7.56 |
| 44766.010416666664 | 7.55 |
| 44766.020833333336 | 7.54 |
| 44766.03125 | 7.52 |
| 44766.041666666664 | 7.51 |
| 44766.052083333336 | 7.47 |
| 44766.0625 | 7.49 |
| 44766.072916666664 | 7.53 |
| 44766.083333333336 | 7.55 |
| 44766.09375 | 7.55 |
| 44766.104166666664 | 7.58 |
| 44766.114583333336 | 7.58 |
| 44766.125 | 7.56 |
| 44766.135416666664 | 7.56 |
| 44766.145833333336 | 7.55 |
| 44766.15625 | 7.55 |
| 44766.166666666664 | 7.54 |
| 44766.177083333336 | 7.54 |
| 44766.1875 | 7.52 |
| 44766.197916666664 | 7.5 |
| 44766.208333333336 | 7.5 |
| 44766.21875 | 7.49 |
| 44766.229166666664 | 7.48 |
| 44766.239583333336 | 7.47 |
| 44766.25 | 7.47 |
| 44766.260416666664 | 7.47 |
| 44766.270833333336 | 7.46 |
| 44766.28125 | 7.46 |
| 44766.291666666664 | 7.45 |
| 44766.302083333336 | 7.45 |
| 44766.3125 | 7.44 |
| 44766.322916666664 | 7.44 |
| 44766.333333333336 | 7.43 |
| 44766.34375 | 7.43 |
| 44766.354166666664 | 7.43 |
| 44766.364583333336 | 7.43 |
| 44766.375 | 7.43 |
| 44766.385416666664 | 7.42 |
| 44766.395833333336 | 7.42 |
| 44766.40625 | 7.42 |
| 44766.416666666664 | 7.42 |
| 44766.427083333336 | 7.39 |
| 44766.4375 | 7.43 |
| 44766.447916666664 | 7.4 |
| 44766.458333333336 | 7.38 |
| 44766.46875 | 7.37 |
| 44766.479166666664 | 7.37 |
| 44766.489583333336 | 7.42 |
| 44766.5 | 7.42 |
| 44766.510416666664 | 7.41 |
| 44766.520833333336 | 7.42 |
| 44766.53125 | 7.4 |
| 44766.541666666664 | 7.39 |
| 44766.552083333336 | 7.41 |
| 44766.5625 | 7.41 |
| 44766.572916666664 | 7.42 |
| 44766.583333333336 | 7.42 |
| 44766.59375 | 7.43 |
| 44766.604166666664 | 7.43 |
| 44766.614583333336 | 7.44 |
| 44766.625 | 7.45 |
| 44766.635416666664 | 7.47 |
| 44766.645833333336 | 7.48 |
| 44766.65625 | 7.49 |
| 44766.666666666664 | 7.5 |
| 44766.677083333336 | 7.53 |
| 44766.6875 | 7.52 |
| 44766.697916666664 | 7.51 |
| 44766.708333333336 | 7.5 |
| 44766.71875 | 7.49 |
| 44766.729166666664 | 7.47 |
| 44766.739583333336 | 7.48 |
| 44766.75 | 7.5 |
| 44766.760416666664 | 7.5 |
| 44766.770833333336 | 7.5 |
| 44766.78125 | 7.52 |
| 44766.791666666664 | 7.53 |
| 44766.802083333336 | 7.56 |
| 44766.8125 | 7.57 |
| 44766.822916666664 | 7.58 |
| 44766.833333333336 | 7.59 |
| 44766.84375 | 7.58 |
| 44766.854166666664 | 7.59 |
| 44766.864583333336 | 7.59 |
| 44766.875 | 7.58 |
| 44766.885416666664 | 7.58 |
| 44766.895833333336 | 7.58 |
| 44766.90625 | 7.58 |
| 44766.916666666664 | 7.58 |
| 44766.927083333336 | 7.59 |
| 44766.9375 | 7.59 |
| 44766.947916666664 | 7.59 |
| 44766.958333333336 | 7.58 |
| 44766.96875 | 7.57 |
| 44766.979166666664 | 7.58 |
| 44766.989583333336 | 7.59 |
| 44767.0 | 7.58 |
| 44767.010416666664 | 7.57 |
| 44767.020833333336 | 7.55 |
| 44767.03125 | 7.55 |
| 44767.041666666664 | 7.55 |
| 44767.052083333336 | 7.54 |
| 44767.0625 | 7.55 |
| 44767.072916666664 | 7.54 |
| 44767.083333333336 | 7.54 |
| 44767.09375 | 7.55 |
| 44767.104166666664 | 7.56 |
| 44767.114583333336 | 7.57 |
| 44767.125 | 7.57 |
| 44767.135416666664 | 7.55 |
| 44767.145833333336 | 7.54 |
| 44767.15625 | 7.55 |
| 44767.166666666664 | 7.54 |
| 44767.177083333336 | 7.54 |
| 44767.1875 | 7.53 |
| 44767.197916666664 | 7.52 |
| 44767.208333333336 | 7.52 |
| 44767.21875 | 7.52 |
| 44767.229166666664 | 7.5 |
| 44767.239583333336 | 7.49 |
| 44767.25 | 7.48 |
| 44767.260416666664 | 7.47 |
| 44767.270833333336 | 7.47 |
| 44767.28125 | 7.46 |
| 44767.291666666664 | 7.47 |
| 44767.302083333336 | 7.47 |
| 44767.3125 | 7.47 |
| 44767.322916666664 | 7.48 |
| 44767.333333333336 | 7.48 |
| 44767.34375 | 7.49 |
| 44767.354166666664 | 7.49 |
| 44767.364583333336 | 7.49 |
| 44767.375 | 7.5 |
| 44767.385416666664 | 7.5 |
| 44767.395833333336 | 7.5 |
| 44767.40625 | 7.51 |
| 44767.416666666664 | 7.51 |
| 44767.427083333336 | 7.52 |
| 44767.4375 | 7.52 |
| 44767.447916666664 | 7.53 |
| 44767.458333333336 | 7.49 |
| 44767.46875 | 7.45 |
| 44767.479166666664 | 7.48 |
| 44767.489583333336 | 7.48 |
| 44767.5 | 7.55 |
| 44767.510416666664 | 7.56 |
| 44767.520833333336 | 7.55 |
| 44767.53125 | 7.55 |
| 44767.541666666664 | 7.53 |
| 44767.552083333336 | 7.53 |
| 44767.5625 | 7.52 |
| 44767.572916666664 | 7.52 |
| 44767.583333333336 | 7.52 |
| 44767.59375 | 7.51 |
| 44767.604166666664 | 7.5 |
| 44767.614583333336 | 7.49 |
| 44767.625 | 7.49 |
| 44767.635416666664 | 7.49 |
| 44767.645833333336 | 7.49 |
| 44767.65625 | 7.5 |
| 44767.666666666664 | 7.51 |
| 44767.677083333336 | 7.51 |
| 44767.6875 | 7.51 |
| 44767.697916666664 | 7.51 |
| 44767.708333333336 | 7.51 |
| 44767.71875 | 7.52 |
| 44767.729166666664 | 7.53 |
| 44767.739583333336 | 7.51 |
| 44767.75 | 7.51 |
| 44767.760416666664 | 7.49 |
| 44767.770833333336 | 7.49 |
| 44767.78125 | 7.53 |
| 44767.791666666664 | 7.56 |
| 44767.802083333336 | 7.57 |
| 44767.8125 | 7.57 |
| 44767.822916666664 | 7.6 |
| 44767.833333333336 | 7.61 |
| 44767.84375 | 7.62 |
| 44767.854166666664 | 7.63 |
| 44767.864583333336 | 7.66 |
| 44767.875 | 7.66 |
| 44767.885416666664 | 7.66 |
| 44767.895833333336 | 7.65 |
| 44767.90625 | 7.66 |
| 44767.916666666664 | 7.66 |
| 44767.927083333336 | 7.65 |
| 44767.9375 | 7.65 |
| 44767.947916666664 | 7.64 |
| 44767.958333333336 | 7.63 |
| 44767.96875 | 7.62 |
| 44767.979166666664 | 7.6 |
| 44767.989583333336 | 7.58 |
| 44768.0 | 7.56 |
| 44768.010416666664 | 7.6 |
| 44768.020833333336 | 7.6 |
| 44768.03125 | 7.56 |
| 44768.041666666664 | 7.58 |
| 44768.052083333336 | 7.59 |
| 44768.0625 | 7.56 |
| 44768.072916666664 | 7.55 |
| 44768.083333333336 | 7.53 |
| 44768.09375 | 7.55 |
| 44768.104166666664 | 7.52 |
| 44768.114583333336 | 7.52 |
| 44768.125 | 7.51 |
| 44768.135416666664 | 7.51 |
| 44768.145833333336 | 7.51 |
| 44768.15625 | 7.51 |
| 44768.166666666664 | 7.5 |
| 44768.177083333336 | 7.5 |
| 44768.1875 | 7.49 |
| 44768.197916666664 | 7.49 |
| 44768.208333333336 | 7.49 |
| 44768.21875 | 7.49 |
| 44768.229166666664 | 7.48 |
| 44768.239583333336 | 7.48 |
| 44768.25 | 7.48 |
| 44768.260416666664 | 7.46 |
| 44768.270833333336 | 7.45 |
| 44768.28125 | 7.45 |
| 44768.291666666664 | 7.45 |
| 44768.302083333336 | 7.44 |
| 44768.3125 | 7.43 |
| 44768.322916666664 | 7.43 |
| 44768.333333333336 | 7.44 |
| 44768.34375 | 7.45 |
| 44768.354166666664 | 7.46 |
| 44768.364583333336 | 7.46 |
| 44768.375 | 7.47 |
| 44768.385416666664 | 7.47 |
| 44768.395833333336 | 7.48 |
| 44768.40625 | 7.48 |
| 44768.416666666664 | 7.49 |
| 44768.427083333336 | 7.49 |
| 44768.4375 | 7.49 |
| 44768.447916666664 | 7.49 |
| 44768.458333333336 | 7.48 |
| 44768.46875 | 7.44 |
| 44768.479166666664 | 7.44 |
| 44768.489583333336 | 7.45 |
| 44768.5 | 7.51 |
| 44768.510416666664 | 7.51 |
| 44768.520833333336 | 7.48 |
| 44768.53125 | 7.53 |
| 44768.541666666664 | 7.49 |
| 44768.552083333336 | 7.52 |
| 44768.5625 | 7.52 |
| 44768.572916666664 | 7.5 |
| 44768.583333333336 | 7.49 |
| 44768.59375 | 7.47 |
| 44768.604166666664 | 7.46 |
| 44768.614583333336 | 7.45 |
| 44768.625 | 7.45 |
| 44768.635416666664 | 7.45 |
| 44768.645833333336 | 7.45 |
| 44768.65625 | 7.44 |
| 44768.666666666664 | 7.44 |
| 44768.677083333336 | 7.43 |
| 44768.6875 | 7.43 |
| 44768.697916666664 | 7.44 |
| 44768.708333333336 | 7.44 |
| 44768.71875 | 7.44 |
| 44768.729166666664 | 7.44 |
| 44768.739583333336 | 7.43 |
| 44768.75 | 7.43 |
| 44768.760416666664 | 7.42 |
| 44768.770833333336 | 7.41 |
| 44768.78125 | 7.42 |
| 44768.791666666664 | 7.42 |
| 44768.802083333336 | 7.43 |
| 44768.8125 | 7.46 |
| 44768.822916666664 | 7.48 |
| 44768.833333333336 | 7.5 |
| 44768.84375 | 7.5 |
| 44768.854166666664 | 7.5 |
| 44768.864583333336 | 7.51 |
| 44768.875 | 7.53 |
| 44768.885416666664 | 7.53 |
| 44768.895833333336 | 7.55 |
| 44768.90625 | 7.55 |
| 44768.916666666664 | 7.56 |
| 44768.927083333336 | 7.56 |
| 44768.9375 | 7.56 |
| 44768.947916666664 | 7.55 |
| 44768.958333333336 | 7.55 |
| 44768.96875 | 7.55 |
| 44768.979166666664 | 7.55 |
| 44768.989583333336 | 7.54 |
| 44769.0 | 7.54 |
| 44769.010416666664 | 7.54 |
| 44769.020833333336 | 7.54 |
| 44769.03125 | 7.53 |
| 44769.041666666664 | 7.51 |
| 44769.052083333336 | 7.49 |
| 44769.0625 | 7.49 |
| 44769.072916666664 | 7.51 |
| 44769.083333333336 | 7.52 |
| 44769.09375 | 7.46 |
| 44769.104166666664 | 7.47 |
| 44769.114583333336 | 7.44 |
| 44769.125 | 7.43 |
| 44769.135416666664 | 7.41 |
| 44769.145833333336 | 7.39 |
| 44769.15625 | 7.38 |
| 44769.166666666664 | 7.37 |
| 44769.177083333336 | 7.36 |
| 44769.1875 | 7.34 |
| 44769.197916666664 | 7.37 |
| 44769.208333333336 | 7.36 |
| 44769.21875 | 7.39 |
| 44769.229166666664 | 7.38 |
| 44769.239583333336 | 7.39 |
| 44769.25 | 7.4 |
| 44769.260416666664 | 7.39 |
| 44769.270833333336 | 7.36 |
| 44769.28125 | 7.37 |
| 44769.291666666664 | 7.36 |
| 44769.302083333336 | 7.36 |
| 44769.3125 | 7.36 |
| 44769.322916666664 | 7.36 |
| 44769.333333333336 | 7.36 |
| 44769.34375 | 7.35 |
| 44769.354166666664 | 7.36 |
| 44769.364583333336 | 7.37 |
| 44769.375 | 7.37 |
| 44769.385416666664 | 7.4 |
| 44769.395833333336 | 7.42 |
| 44769.40625 | 7.42 |
| 44769.416666666664 | 7.41 |
| 44769.427083333336 | 7.41 |
| 44769.4375 | 7.41 |
| 44769.447916666664 | 7.42 |
| 44769.458333333336 | 7.42 |
| 44769.46875 | 7.42 |
| 44769.479166666664 | 7.42 |
| 44769.489583333336 | 7.43 |
| 44769.5 | 7.43 |
| 44769.510416666664 | 7.43 |
| 44769.520833333336 | 7.44 |
| 44769.53125 | 7.4 |
| 44769.541666666664 | 7.39 |
| 44769.552083333336 | 7.42 |
| 44769.5625 | 7.44 |
| 44769.572916666664 | 7.42 |
| 44769.583333333336 | 7.42 |
| 44769.59375 | 7.42 |
| 44769.604166666664 | 7.42 |
| 44769.614583333336 | 7.44 |
| 44769.625 | 7.44 |
| 44769.635416666664 | 7.43 |
| 44769.645833333336 | 7.43 |
| 44769.65625 | 7.43 |
| 44769.666666666664 | 7.43 |
| 44769.677083333336 | 7.43 |
| 44769.6875 | 7.43 |
| 44769.697916666664 | 7.44 |
| 44769.708333333336 | 7.43 |
| 44769.71875 | 7.44 |
| 44769.729166666664 | 7.45 |
| 44769.739583333336 | 7.43 |
| 44769.75 | 7.46 |
| 44769.760416666664 | 7.46 |
| 44769.770833333336 | 7.47 |
| 44769.78125 | 7.46 |
| 44769.791666666664 | 7.46 |
| 44769.802083333336 | 7.45 |
| 44769.8125 | 7.44 |
| 44769.822916666664 | 7.45 |
| 44769.833333333336 | 7.45 |
| 44769.84375 | 7.46 |
| 44769.854166666664 | 7.47 |
| 44769.864583333336 | 7.48 |
| 44769.875 | 7.48 |
| 44769.885416666664 | 7.48 |
| 44769.895833333336 | 7.48 |
| 44769.90625 | 7.49 |
| 44769.916666666664 | 7.49 |
| 44769.927083333336 | 7.5 |
| 44769.9375 | 7.52 |
| 44769.947916666664 | 7.52 |
| 44769.958333333336 | 7.53 |
| 44769.96875 | 7.54 |
| 44769.979166666664 | 7.54 |
| 44769.989583333336 | 7.55 |
| 44770.0 | 7.55 |
| 44770.010416666664 | 7.55 |
| 44770.020833333336 | 7.56 |
| 44770.03125 | 7.56 |
| 44770.041666666664 | 7.54 |
| 44770.052083333336 | 7.53 |
| 44770.0625 | 7.51 |
| 44770.072916666664 | 7.51 |
| 44770.083333333336 | 7.52 |
| 44770.09375 | 7.52 |
| 44770.104166666664 | 7.49 |
| 44770.114583333336 | 7.46 |
| 44770.125 | 7.47 |
| 44770.135416666664 | 7.43 |
| 44770.145833333336 | 7.4 |
| 44770.15625 | 7.36 |
| 44770.166666666664 | 7.34 |
| 44770.177083333336 | 7.33 |
| 44770.1875 | 7.35 |
| 44770.197916666664 | 7.36 |
| 44770.208333333336 | 7.36 |
| 44770.21875 | 7.36 |
| 44770.229166666664 | 7.38 |
| 44770.239583333336 | 7.37 |
| 44770.25 | 7.4 |
| 44770.260416666664 | 7.4 |
| 44770.270833333336 | 7.4 |
| 44770.28125 | 7.42 |
| 44770.291666666664 | 7.41 |
| 44770.302083333336 | 7.41 |
| 44770.3125 | 7.41 |
| 44770.322916666664 | 7.39 |
| 44770.333333333336 | 7.39 |
| 44770.34375 | 7.38 |
| 44770.354166666664 | 7.38 |
| 44770.364583333336 | 7.38 |
| 44770.375 | 7.37 |
| 44770.385416666664 | 7.37 |
| 44770.395833333336 | 7.38 |
| 44770.40625 | 7.39 |
| 44770.416666666664 | 7.39 |
| 44770.427083333336 | 7.4 |
| 44770.4375 | 7.4 |
| 44770.447916666664 | 7.4 |
| 44770.458333333336 | 7.4 |
| 44770.46875 | 7.39 |
| 44770.479166666664 | 7.4 |
| 44770.489583333336 | 7.39 |
| 44770.5 | 7.39 |
| 44770.510416666664 | 7.39 |
| 44770.520833333336 | 7.39 |
| 44770.53125 | 7.39 |
| 44770.541666666664 | 7.4 |
| 44770.552083333336 | 7.39 |
| 44770.5625 | 7.4 |
| 44770.572916666664 | 7.4 |
| 44770.583333333336 | 7.38 |
| 44770.59375 | 7.41 |
| 44770.604166666664 | 7.41 |
| 44770.614583333336 | 7.41 |
| 44770.625 | 7.41 |
| 44770.635416666664 | 7.43 |
| 44770.645833333336 | 7.43 |
| 44770.65625 | 7.43 |
| 44770.666666666664 | 7.43 |
| 44770.677083333336 | 7.43 |
| 44770.6875 | 7.43 |
| 44770.697916666664 | 7.44 |
| 44770.708333333336 | 7.45 |
| 44770.71875 | 7.46 |
| 44770.729166666664 | 7.47 |
| 44770.739583333336 | 7.48 |
| 44770.75 | 7.49 |
| 44770.760416666664 | 7.51 |
| 44770.770833333336 | 7.55 |
| 44770.78125 | 7.57 |
| 44770.791666666664 | 7.54 |
| 44770.802083333336 | 7.53 |
| 44770.8125 | 7.56 |
| 44770.822916666664 | 7.54 |
| 44770.833333333336 | 7.54 |
| 44770.84375 | 7.53 |
| 44770.854166666664 | 7.55 |
| 44770.864583333336 | 7.52 |
| 44770.875 | 7.53 |
| 44770.885416666664 | 7.53 |
| 44770.895833333336 | 7.52 |
| 44770.90625 | 7.51 |
| 44770.916666666664 | 7.5 |
| 44770.927083333336 | 7.49 |
| 44770.9375 | 7.49 |
| 44770.947916666664 | 7.49 |
| 44770.958333333336 | 7.5 |
| 44770.96875 | 7.5 |
| 44770.979166666664 | 7.51 |
| 44770.989583333336 | 7.53 |
| 44771.0 | 7.54 |
| 44771.010416666664 | 7.55 |
| 44771.020833333336 | 7.55 |
| 44771.03125 | 7.55 |
| 44771.041666666664 | 7.55 |
| 44771.052083333336 | 7.54 |
| 44771.0625 | 7.54 |
| 44771.072916666664 | 7.53 |
| 44771.083333333336 | 7.52 |
| 44771.09375 | 7.51 |
| 44771.104166666664 | 7.51 |
| 44771.114583333336 | 7.51 |
| 44771.125 | 7.49 |
| 44771.135416666664 | 7.49 |
| 44771.145833333336 | 7.47 |
| 44771.15625 | 7.48 |
| 44771.166666666664 | 7.45 |
| 44771.177083333336 | 7.4 |
| 44771.1875 | 7.35 |
| 44771.197916666664 | 7.33 |
| 44771.208333333336 | 7.34 |
| 44771.21875 | 7.37 |
| 44771.229166666664 | 7.39 |
| 44771.239583333336 | 7.4 |
| 44771.25 | 7.43 |
| 44771.260416666664 | 7.41 |
| 44771.270833333336 | 7.43 |
| 44771.28125 | 7.42 |
| 44771.291666666664 | 7.42 |
| 44771.302083333336 | 7.43 |
| 44771.3125 | 7.42 |
| 44771.322916666664 | 7.41 |
| 44771.333333333336 | 7.4 |
| 44771.34375 | 7.4 |
| 44771.354166666664 | 7.39 |
| 44771.364583333336 | 7.38 |
| 44771.375 | 7.38 |
| 44771.385416666664 | 7.38 |
| 44771.395833333336 | 7.37 |
| 44771.40625 | 7.36 |
| 44771.416666666664 | 7.37 |
| 44771.427083333336 | 7.37 |
| 44771.4375 | 7.37 |
| 44771.447916666664 | 7.37 |
| 44771.458333333336 | 7.37 |
| 44771.46875 | 7.37 |
| 44771.479166666664 | 7.36 |
| 44771.489583333336 | 7.36 |
| 44771.5 | 7.36 |
| 44771.510416666664 | 7.36 |
| 44771.520833333336 | 7.37 |
| 44771.53125 | 7.37 |
| 44771.541666666664 | 7.37 |
| 44771.552083333336 | 7.37 |
| 44771.5625 | 7.38 |
| 44771.572916666664 | 7.38 |
| 44771.583333333336 | 7.38 |
| 44771.59375 | 7.39 |
| 44771.604166666664 | 7.37 |
| 44771.614583333336 | 7.37 |
| 44771.625 | 7.38 |
| 44771.635416666664 | 7.4 |
| 44771.645833333336 | 7.4 |
| 44771.65625 | 7.39 |
| 44771.666666666664 | 7.39 |
| 44771.677083333336 | 7.39 |
| 44771.6875 | 7.4 |
| 44771.697916666664 | 7.4 |
| 44771.708333333336 | 7.42 |
| 44771.71875 | 7.43 |
| 44771.729166666664 | 7.45 |
| 44771.739583333336 | 7.48 |
| 44771.75 | 7.49 |
| 44771.760416666664 | 7.5 |
| 44771.770833333336 | 7.52 |
| 44771.78125 | 7.54 |
| 44771.791666666664 | 7.56 |
| 44771.802083333336 | 7.57 |
| 44771.8125 | 7.57 |
| 44771.822916666664 | 7.57 |
| 44771.833333333336 | 7.55 |
| 44771.84375 | 7.53 |
| 44771.854166666664 | 7.51 |
| 44771.864583333336 | 7.5 |
| 44771.875 | 7.48 |
| 44771.885416666664 | 7.48 |
| 44771.895833333336 | 7.49 |
| 44771.90625 | 7.5 |
| 44771.916666666664 | 7.49 |
| 44771.927083333336 | 7.49 |
| 44771.9375 | 7.47 |
| 44771.947916666664 | 7.47 |
| 44771.958333333336 | 7.46 |
| 44771.96875 | 7.46 |
| 44771.979166666664 | 7.46 |
| 44771.989583333336 | 7.46 |
| 44772.0 | 7.48 |
| 44772.010416666664 | 7.49 |
| 44772.020833333336 | 7.51 |
| 44772.03125 | 7.52 |
| 44772.041666666664 | 7.51 |
| 44772.052083333336 | 7.51 |
| 44772.0625 | 7.51 |
| 44772.072916666664 | 7.5 |
| 44772.083333333336 | 7.5 |
| 44772.09375 | 7.49 |
| 44772.104166666664 | 7.48 |
| 44772.114583333336 | 7.47 |
| 44772.125 | 7.45 |
| 44772.135416666664 | 7.46 |
| 44772.145833333336 | 7.46 |
| 44772.15625 | 7.45 |
| 44772.166666666664 | 7.42 |
| 44772.177083333336 | 7.4 |
| 44772.1875 | 7.38 |
| 44772.197916666664 | 7.36 |
| 44772.208333333336 | 7.38 |
| 44772.21875 | 7.34 |
| 44772.229166666664 | 7.34 |
| 44772.239583333336 | 7.31 |
| 44772.25 | 7.32 |
| 44772.260416666664 | 7.32 |
| 44772.270833333336 | 7.31 |
| 44772.28125 | 7.31 |
| 44772.291666666664 | 7.31 |
| 44772.302083333336 | 7.3 |
| 44772.3125 | 7.31 |
| 44772.322916666664 | 7.29 |
| 44772.333333333336 | 7.3 |
| 44772.34375 | 7.29 |
| 44772.354166666664 | 7.29 |
| 44772.364583333336 | 7.3 |
| 44772.375 | 7.29 |
| 44772.385416666664 | 7.28 |
| 44772.395833333336 | 7.3 |
| 44772.40625 | 7.3 |
| 44772.416666666664 | 7.3 |
| 44772.427083333336 | 7.3 |
| 44772.4375 | 7.31 |
| 44772.447916666664 | 7.32 |
| 44772.458333333336 | 7.33 |
| 44772.46875 | 7.33 |
| 44772.479166666664 | 7.34 |
| 44772.489583333336 | 7.34 |
| 44772.5 | 7.35 |
| 44772.510416666664 | 7.35 |
| 44772.520833333336 | 7.35 |
| 44772.53125 | 7.34 |
| 44772.541666666664 | 7.35 |
| 44772.552083333336 | 7.35 |
| 44772.5625 | 7.36 |
| 44772.572916666664 | 7.36 |
| 44772.583333333336 | 7.37 |
| 44772.59375 | 7.38 |
| 44772.604166666664 | 7.39 |
| 44772.614583333336 | 7.38 |
| 44772.625 | 7.39 |
| 44772.635416666664 | 7.4 |
| 44772.645833333336 | 7.41 |
| 44772.65625 | 7.42 |
| 44772.666666666664 | 7.43 |
| 44772.677083333336 | 7.45 |
| 44772.6875 | 7.45 |
| 44772.697916666664 | 7.45 |
| 44772.708333333336 | 7.44 |
| 44772.71875 | 7.45 |
| 44772.729166666664 | 7.46 |
| 44772.739583333336 | 7.47 |
| 44772.75 | 7.49 |
| 44772.760416666664 | 7.49 |
| 44772.770833333336 | 7.5 |
| 44772.78125 | 7.5 |
| 44772.791666666664 | 7.5 |
| 44772.802083333336 | 7.51 |
| 44772.8125 | 7.52 |
| 44772.822916666664 | 7.53 |
| 44772.833333333336 | 7.55 |
| 44772.84375 | 7.55 |
| 44772.854166666664 | 7.54 |
| 44772.864583333336 | 7.57 |
| 44772.875 | 7.55 |
| 44772.885416666664 | 7.54 |
| 44772.895833333336 | 7.53 |
| 44772.90625 | 7.52 |
| 44772.916666666664 | 7.51 |
| 44772.927083333336 | 7.51 |
| 44772.9375 | 7.52 |
| 44772.947916666664 | 7.52 |
| 44772.958333333336 | 7.52 |
| 44772.96875 | 7.53 |
| 44772.979166666664 | 7.52 |
| 44772.989583333336 | 7.52 |
| 44773.0 | 7.51 |
| 44773.010416666664 | 7.5 |
| 44773.020833333336 | 7.49 |
| 44773.03125 | 7.49 |
| 44773.041666666664 | 7.5 |
| 44773.052083333336 | 7.51 |
| 44773.0625 | 7.52 |
| 44773.072916666664 | 7.52 |
| 44773.083333333336 | 7.52 |
| 44773.09375 | 7.53 |
| 44773.104166666664 | 7.52 |
| 44773.114583333336 | 7.52 |
| 44773.125 | 7.52 |
| 44773.135416666664 | 7.49 |
| 44773.145833333336 | 7.48 |
| 44773.15625 | 7.48 |
| 44773.166666666664 | 7.49 |
| 44773.177083333336 | 7.49 |
| 44773.1875 | 7.45 |
| 44773.197916666664 | 7.44 |
| 44773.208333333336 | 7.41 |
| 44773.21875 | 7.4 |
| 44773.229166666664 | 7.39 |
| 44773.239583333336 | 7.38 |
| 44773.25 | 7.39 |
| 44773.260416666664 | 7.39 |
| 44773.270833333336 | 7.43 |
| 44773.28125 | 7.42 |
| 44773.291666666664 | 7.43 |
| 44773.302083333336 | 7.43 |
| 44773.3125 | 7.43 |
| 44773.322916666664 | 7.43 |
| 44773.333333333336 | 7.43 |
| 44773.34375 | 7.43 |
| 44773.354166666664 | 7.42 |
| 44773.364583333336 | 7.41 |
| 44773.375 | 7.4 |
| 44773.385416666664 | 7.4 |
| 44773.395833333336 | 7.39 |
| 44773.40625 | 7.38 |
| 44773.416666666664 | 7.37 |
| 44773.427083333336 | 7.38 |
| 44773.4375 | 7.38 |
| 44773.447916666664 | 7.37 |
| 44773.458333333336 | 7.37 |
| 44773.46875 | 7.37 |
| 44773.479166666664 | 7.37 |
| 44773.489583333336 | 7.38 |
| 44773.5 | 7.38 |
| 44773.510416666664 | 7.38 |
| 44773.520833333336 | 7.38 |
| 44773.53125 | 7.39 |
| 44773.541666666664 | 7.39 |
| 44773.552083333336 | 7.39 |
| 44773.5625 | 7.4 |
| 44773.572916666664 | 7.4 |
| 44773.583333333336 | 7.41 |
| 44773.59375 | 7.41 |
| 44773.604166666664 | 7.42 |
| 44773.614583333336 | 7.41 |
| 44773.625 | 7.41 |
| 44773.635416666664 | 7.42 |
| 44773.645833333336 | 7.4 |
| 44773.65625 | 7.41 |
| 44773.666666666664 | 7.45 |
| 44773.677083333336 | 7.47 |
| 44773.6875 | 7.46 |
| 44773.697916666664 | 7.47 |
| 44773.708333333336 | 7.47 |
| 44773.71875 | 7.47 |
| 44773.729166666664 | 7.46 |
| 44773.739583333336 | 7.47 |
| 44773.75 | 7.48 |
| 44773.760416666664 | 7.49 |
| 44773.770833333336 | 7.51 |
| 44773.78125 | 7.53 |
| 44773.791666666664 | 7.54 |
| 44773.802083333336 | 7.56 |
| 44773.8125 | 7.56 |
| 44773.822916666664 | 7.56 |
| 44773.833333333336 | 7.56 |
| 44773.84375 | 7.56 |
| 44773.854166666664 | 7.56 |
| 44773.864583333336 | 7.56 |
| 44773.875 | 7.55 |
| 44773.885416666664 | 7.54 |
| 44773.895833333336 | 7.56 |
| 44773.90625 | 7.54 |
| 44773.916666666664 | 7.52 |
| 44773.927083333336 | 7.52 |
| 44773.9375 | 7.51 |
| 44773.947916666664 | 7.51 |
| 44773.958333333336 | 7.52 |
| 44773.96875 | 7.52 |
| 44773.979166666664 | 7.51 |
| 44773.989583333336 | 7.51 |
| 44774.0 | 7.5 |
| 44774.010416666664 | 7.49 |
| 44774.020833333336 | 7.48 |
| 44774.03125 | 7.48 |
| 44774.041666666664 | 7.48 |
| 44774.052083333336 | 7.49 |
| 44774.0625 | 7.5 |
| 44774.072916666664 | 7.5 |
| 44774.083333333336 | 7.52 |
| 44774.09375 | 7.52 |
| 44774.104166666664 | 7.51 |
| 44774.114583333336 | 7.51 |
| 44774.125 | 7.51 |
| 44774.135416666664 | 7.5 |
| 44774.145833333336 | 7.5 |
| 44774.15625 | 7.51 |